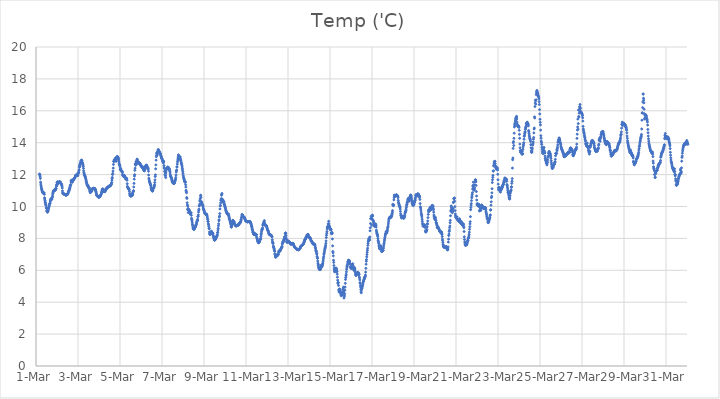
| Category | Temp ('C) |
|---|---|
| 44986.166666666664 | 12.034 |
| 44986.177083333336 | 12.013 |
| 44986.1875 | 11.928 |
| 44986.197916666664 | 11.856 |
| 44986.208333333336 | 11.757 |
| 44986.21875 | 11.527 |
| 44986.229166666664 | 11.407 |
| 44986.239583333336 | 11.298 |
| 44986.25 | 11.218 |
| 44986.260416666664 | 11.14 |
| 44986.270833333336 | 11.085 |
| 44986.28125 | 11.029 |
| 44986.291666666664 | 10.981 |
| 44986.302083333336 | 10.935 |
| 44986.3125 | 10.884 |
| 44986.322916666664 | 10.879 |
| 44986.333333333336 | 10.862 |
| 44986.34375 | 10.838 |
| 44986.354166666664 | 10.84 |
| 44986.364583333336 | 10.852 |
| 44986.375 | 10.844 |
| 44986.385416666664 | 10.856 |
| 44986.395833333336 | 10.761 |
| 44986.40625 | 10.544 |
| 44986.416666666664 | 10.469 |
| 44986.427083333336 | 10.374 |
| 44986.4375 | 10.273 |
| 44986.447916666664 | 10.234 |
| 44986.458333333336 | 10.157 |
| 44986.46875 | 10.096 |
| 44986.479166666664 | 10.082 |
| 44986.489583333336 | 9.933 |
| 44986.5 | 9.889 |
| 44986.510416666664 | 9.725 |
| 44986.520833333336 | 9.76 |
| 44986.53125 | 9.671 |
| 44986.541666666664 | 9.65 |
| 44986.552083333336 | 9.66 |
| 44986.5625 | 9.676 |
| 44986.572916666664 | 9.746 |
| 44986.583333333336 | 9.793 |
| 44986.59375 | 9.881 |
| 44986.604166666664 | 9.908 |
| 44986.614583333336 | 9.972 |
| 44986.625 | 9.996 |
| 44986.635416666664 | 10.088 |
| 44986.645833333336 | 10.155 |
| 44986.65625 | 10.162 |
| 44986.666666666664 | 10.201 |
| 44986.677083333336 | 10.286 |
| 44986.6875 | 10.369 |
| 44986.697916666664 | 10.435 |
| 44986.708333333336 | 10.478 |
| 44986.71875 | 10.458 |
| 44986.729166666664 | 10.459 |
| 44986.739583333336 | 10.46 |
| 44986.75 | 10.443 |
| 44986.760416666664 | 10.534 |
| 44986.770833333336 | 10.564 |
| 44986.78125 | 10.607 |
| 44986.791666666664 | 10.716 |
| 44986.802083333336 | 10.809 |
| 44986.8125 | 10.876 |
| 44986.822916666664 | 10.927 |
| 44986.833333333336 | 10.964 |
| 44986.84375 | 10.987 |
| 44986.854166666664 | 11.011 |
| 44986.864583333336 | 11.025 |
| 44986.875 | 11.035 |
| 44986.885416666664 | 11.037 |
| 44986.895833333336 | 11.038 |
| 44986.90625 | 11.039 |
| 44986.916666666664 | 11.016 |
| 44986.927083333336 | 11.037 |
| 44986.9375 | 11.1 |
| 44986.947916666664 | 11.151 |
| 44986.958333333336 | 11.122 |
| 44986.96875 | 11.281 |
| 44986.979166666664 | 11.364 |
| 44986.989583333336 | 11.3 |
| 44987.0 | 11.504 |
| 44987.010416666664 | 11.483 |
| 44987.020833333336 | 11.418 |
| 44987.03125 | 11.565 |
| 44987.041666666664 | 11.452 |
| 44987.052083333336 | 11.453 |
| 44987.0625 | 11.455 |
| 44987.072916666664 | 11.481 |
| 44987.083333333336 | 11.502 |
| 44987.09375 | 11.519 |
| 44987.104166666664 | 11.537 |
| 44987.114583333336 | 11.541 |
| 44987.125 | 11.547 |
| 44987.135416666664 | 11.523 |
| 44987.145833333336 | 11.537 |
| 44987.15625 | 11.538 |
| 44987.166666666664 | 11.507 |
| 44987.177083333336 | 11.448 |
| 44987.1875 | 11.435 |
| 44987.197916666664 | 11.417 |
| 44987.208333333336 | 11.402 |
| 44987.21875 | 11.386 |
| 44987.229166666664 | 11.338 |
| 44987.239583333336 | 11.27 |
| 44987.25 | 11.157 |
| 44987.260416666664 | 10.979 |
| 44987.270833333336 | 10.867 |
| 44987.28125 | 10.803 |
| 44987.291666666664 | 10.82 |
| 44987.302083333336 | 10.815 |
| 44987.3125 | 10.8 |
| 44987.322916666664 | 10.79 |
| 44987.333333333336 | 10.78 |
| 44987.34375 | 10.767 |
| 44987.354166666664 | 10.758 |
| 44987.364583333336 | 10.757 |
| 44987.375 | 10.745 |
| 44987.385416666664 | 10.734 |
| 44987.395833333336 | 10.734 |
| 44987.40625 | 10.727 |
| 44987.416666666664 | 10.717 |
| 44987.427083333336 | 10.716 |
| 44987.4375 | 10.756 |
| 44987.447916666664 | 10.721 |
| 44987.458333333336 | 10.734 |
| 44987.46875 | 10.74 |
| 44987.479166666664 | 10.741 |
| 44987.489583333336 | 10.746 |
| 44987.5 | 10.768 |
| 44987.510416666664 | 10.786 |
| 44987.520833333336 | 10.828 |
| 44987.53125 | 10.853 |
| 44987.541666666664 | 10.918 |
| 44987.552083333336 | 10.949 |
| 44987.5625 | 10.969 |
| 44987.572916666664 | 10.996 |
| 44987.583333333336 | 11.05 |
| 44987.59375 | 11.083 |
| 44987.604166666664 | 11.145 |
| 44987.614583333336 | 11.179 |
| 44987.625 | 11.248 |
| 44987.635416666664 | 11.318 |
| 44987.645833333336 | 11.363 |
| 44987.65625 | 11.368 |
| 44987.666666666664 | 11.534 |
| 44987.677083333336 | 11.626 |
| 44987.6875 | 11.626 |
| 44987.697916666664 | 11.645 |
| 44987.708333333336 | 11.579 |
| 44987.71875 | 11.544 |
| 44987.729166666664 | 11.524 |
| 44987.739583333336 | 11.598 |
| 44987.75 | 11.623 |
| 44987.760416666664 | 11.624 |
| 44987.770833333336 | 11.628 |
| 44987.78125 | 11.681 |
| 44987.791666666664 | 11.699 |
| 44987.802083333336 | 11.722 |
| 44987.8125 | 11.749 |
| 44987.822916666664 | 11.748 |
| 44987.833333333336 | 11.764 |
| 44987.84375 | 11.775 |
| 44987.854166666664 | 11.807 |
| 44987.864583333336 | 11.849 |
| 44987.875 | 11.904 |
| 44987.885416666664 | 11.949 |
| 44987.895833333336 | 11.959 |
| 44987.90625 | 11.962 |
| 44987.916666666664 | 11.957 |
| 44987.927083333336 | 11.962 |
| 44987.9375 | 11.98 |
| 44987.947916666664 | 11.977 |
| 44987.958333333336 | 11.976 |
| 44987.96875 | 11.975 |
| 44987.979166666664 | 11.944 |
| 44987.989583333336 | 11.935 |
| 44988.0 | 12.038 |
| 44988.010416666664 | 12.122 |
| 44988.020833333336 | 12.107 |
| 44988.03125 | 12.126 |
| 44988.041666666664 | 12.238 |
| 44988.052083333336 | 12.302 |
| 44988.0625 | 12.454 |
| 44988.072916666664 | 12.564 |
| 44988.083333333336 | 12.496 |
| 44988.09375 | 12.642 |
| 44988.104166666664 | 12.684 |
| 44988.114583333336 | 12.73 |
| 44988.125 | 12.717 |
| 44988.135416666664 | 12.828 |
| 44988.145833333336 | 12.867 |
| 44988.15625 | 12.881 |
| 44988.166666666664 | 12.892 |
| 44988.177083333336 | 12.907 |
| 44988.1875 | 12.868 |
| 44988.197916666664 | 12.775 |
| 44988.208333333336 | 12.751 |
| 44988.21875 | 12.7 |
| 44988.229166666664 | 12.627 |
| 44988.239583333336 | 12.588 |
| 44988.25 | 12.504 |
| 44988.260416666664 | 12.387 |
| 44988.270833333336 | 12.233 |
| 44988.28125 | 12.117 |
| 44988.291666666664 | 12.044 |
| 44988.302083333336 | 12.011 |
| 44988.3125 | 11.971 |
| 44988.322916666664 | 11.938 |
| 44988.333333333336 | 11.898 |
| 44988.34375 | 11.865 |
| 44988.354166666664 | 11.817 |
| 44988.364583333336 | 11.778 |
| 44988.375 | 11.703 |
| 44988.385416666664 | 11.651 |
| 44988.395833333336 | 11.576 |
| 44988.40625 | 11.512 |
| 44988.416666666664 | 11.445 |
| 44988.427083333336 | 11.386 |
| 44988.4375 | 11.345 |
| 44988.447916666664 | 11.343 |
| 44988.458333333336 | 11.293 |
| 44988.46875 | 11.29 |
| 44988.479166666664 | 11.292 |
| 44988.489583333336 | 11.243 |
| 44988.5 | 11.19 |
| 44988.510416666664 | 11.175 |
| 44988.520833333336 | 11.184 |
| 44988.53125 | 11.178 |
| 44988.541666666664 | 11.132 |
| 44988.552083333336 | 11.045 |
| 44988.5625 | 10.975 |
| 44988.572916666664 | 10.932 |
| 44988.583333333336 | 10.862 |
| 44988.59375 | 10.915 |
| 44988.604166666664 | 10.91 |
| 44988.614583333336 | 10.967 |
| 44988.625 | 10.944 |
| 44988.635416666664 | 10.998 |
| 44988.645833333336 | 10.94 |
| 44988.65625 | 10.991 |
| 44988.666666666664 | 11.103 |
| 44988.677083333336 | 11.09 |
| 44988.6875 | 11.102 |
| 44988.697916666664 | 11.098 |
| 44988.708333333336 | 11.112 |
| 44988.71875 | 11.13 |
| 44988.729166666664 | 11.146 |
| 44988.739583333336 | 11.131 |
| 44988.75 | 11.124 |
| 44988.760416666664 | 11.103 |
| 44988.770833333336 | 11.111 |
| 44988.78125 | 11.124 |
| 44988.791666666664 | 11.134 |
| 44988.802083333336 | 11.118 |
| 44988.8125 | 11.092 |
| 44988.822916666664 | 11.064 |
| 44988.833333333336 | 11.033 |
| 44988.84375 | 10.979 |
| 44988.854166666664 | 10.935 |
| 44988.864583333336 | 10.882 |
| 44988.875 | 10.801 |
| 44988.885416666664 | 10.725 |
| 44988.895833333336 | 10.688 |
| 44988.90625 | 10.678 |
| 44988.916666666664 | 10.673 |
| 44988.927083333336 | 10.656 |
| 44988.9375 | 10.645 |
| 44988.947916666664 | 10.626 |
| 44988.958333333336 | 10.607 |
| 44988.96875 | 10.598 |
| 44988.979166666664 | 10.585 |
| 44988.989583333336 | 10.58 |
| 44989.0 | 10.601 |
| 44989.010416666664 | 10.665 |
| 44989.020833333336 | 10.613 |
| 44989.03125 | 10.597 |
| 44989.041666666664 | 10.617 |
| 44989.052083333336 | 10.633 |
| 44989.0625 | 10.67 |
| 44989.072916666664 | 10.692 |
| 44989.083333333336 | 10.722 |
| 44989.09375 | 10.741 |
| 44989.104166666664 | 10.78 |
| 44989.114583333336 | 10.831 |
| 44989.125 | 10.898 |
| 44989.135416666664 | 10.932 |
| 44989.145833333336 | 11.014 |
| 44989.15625 | 11.047 |
| 44989.166666666664 | 11.088 |
| 44989.177083333336 | 11.102 |
| 44989.1875 | 11.091 |
| 44989.197916666664 | 11.042 |
| 44989.208333333336 | 11.009 |
| 44989.21875 | 11.033 |
| 44989.229166666664 | 10.931 |
| 44989.239583333336 | 10.92 |
| 44989.25 | 10.937 |
| 44989.260416666664 | 10.959 |
| 44989.270833333336 | 10.952 |
| 44989.28125 | 10.957 |
| 44989.291666666664 | 10.938 |
| 44989.302083333336 | 11.001 |
| 44989.3125 | 11.059 |
| 44989.322916666664 | 11.086 |
| 44989.333333333336 | 11.079 |
| 44989.34375 | 11.1 |
| 44989.354166666664 | 11.113 |
| 44989.364583333336 | 11.128 |
| 44989.375 | 11.157 |
| 44989.385416666664 | 11.175 |
| 44989.395833333336 | 11.187 |
| 44989.40625 | 11.197 |
| 44989.416666666664 | 11.201 |
| 44989.427083333336 | 11.21 |
| 44989.4375 | 11.225 |
| 44989.447916666664 | 11.242 |
| 44989.458333333336 | 11.236 |
| 44989.46875 | 11.275 |
| 44989.479166666664 | 11.275 |
| 44989.489583333336 | 11.276 |
| 44989.5 | 11.269 |
| 44989.510416666664 | 11.295 |
| 44989.520833333336 | 11.287 |
| 44989.53125 | 11.295 |
| 44989.541666666664 | 11.306 |
| 44989.552083333336 | 11.324 |
| 44989.5625 | 11.341 |
| 44989.572916666664 | 11.382 |
| 44989.583333333336 | 11.382 |
| 44989.59375 | 11.458 |
| 44989.604166666664 | 11.506 |
| 44989.614583333336 | 11.649 |
| 44989.625 | 11.755 |
| 44989.635416666664 | 11.825 |
| 44989.645833333336 | 12.004 |
| 44989.65625 | 12.066 |
| 44989.666666666664 | 12.218 |
| 44989.677083333336 | 12.409 |
| 44989.6875 | 12.638 |
| 44989.697916666664 | 12.835 |
| 44989.708333333336 | 12.826 |
| 44989.71875 | 12.834 |
| 44989.729166666664 | 12.931 |
| 44989.739583333336 | 12.883 |
| 44989.75 | 12.9 |
| 44989.760416666664 | 12.963 |
| 44989.770833333336 | 12.946 |
| 44989.78125 | 13.034 |
| 44989.791666666664 | 13.007 |
| 44989.802083333336 | 12.926 |
| 44989.8125 | 12.829 |
| 44989.822916666664 | 12.911 |
| 44989.833333333336 | 12.992 |
| 44989.84375 | 13.068 |
| 44989.854166666664 | 13.107 |
| 44989.864583333336 | 13.126 |
| 44989.875 | 13.131 |
| 44989.885416666664 | 13.118 |
| 44989.895833333336 | 13.101 |
| 44989.90625 | 13.075 |
| 44989.916666666664 | 13.032 |
| 44989.927083333336 | 12.999 |
| 44989.9375 | 12.925 |
| 44989.947916666664 | 12.819 |
| 44989.958333333336 | 12.714 |
| 44989.96875 | 12.647 |
| 44989.979166666664 | 12.61 |
| 44989.989583333336 | 12.562 |
| 44990.0 | 12.481 |
| 44990.010416666664 | 12.341 |
| 44990.020833333336 | 12.314 |
| 44990.03125 | 12.384 |
| 44990.041666666664 | 12.295 |
| 44990.052083333336 | 12.269 |
| 44990.0625 | 12.237 |
| 44990.072916666664 | 12.246 |
| 44990.083333333336 | 12.206 |
| 44990.09375 | 12.211 |
| 44990.104166666664 | 12.189 |
| 44990.114583333336 | 12.121 |
| 44990.125 | 12.004 |
| 44990.135416666664 | 11.938 |
| 44990.145833333336 | 11.954 |
| 44990.15625 | 11.921 |
| 44990.166666666664 | 11.882 |
| 44990.177083333336 | 11.91 |
| 44990.1875 | 11.89 |
| 44990.197916666664 | 11.958 |
| 44990.208333333336 | 11.926 |
| 44990.21875 | 11.89 |
| 44990.229166666664 | 11.879 |
| 44990.239583333336 | 11.82 |
| 44990.25 | 11.808 |
| 44990.260416666664 | 11.76 |
| 44990.270833333336 | 11.732 |
| 44990.28125 | 11.739 |
| 44990.291666666664 | 11.762 |
| 44990.302083333336 | 11.759 |
| 44990.3125 | 11.77 |
| 44990.322916666664 | 11.72 |
| 44990.333333333336 | 11.645 |
| 44990.34375 | 11.427 |
| 44990.354166666664 | 11.259 |
| 44990.364583333336 | 11.217 |
| 44990.375 | 11.196 |
| 44990.385416666664 | 11.162 |
| 44990.395833333336 | 11.135 |
| 44990.40625 | 11.117 |
| 44990.416666666664 | 11.1 |
| 44990.427083333336 | 11.086 |
| 44990.4375 | 11.056 |
| 44990.447916666664 | 10.952 |
| 44990.458333333336 | 10.825 |
| 44990.46875 | 10.729 |
| 44990.479166666664 | 10.695 |
| 44990.489583333336 | 10.688 |
| 44990.5 | 10.666 |
| 44990.510416666664 | 10.657 |
| 44990.520833333336 | 10.653 |
| 44990.53125 | 10.657 |
| 44990.541666666664 | 10.736 |
| 44990.552083333336 | 10.792 |
| 44990.5625 | 10.687 |
| 44990.572916666664 | 10.685 |
| 44990.583333333336 | 10.72 |
| 44990.59375 | 10.737 |
| 44990.604166666664 | 10.74 |
| 44990.614583333336 | 10.86 |
| 44990.625 | 10.927 |
| 44990.635416666664 | 10.983 |
| 44990.645833333336 | 10.982 |
| 44990.65625 | 11.224 |
| 44990.666666666664 | 11.449 |
| 44990.677083333336 | 11.715 |
| 44990.6875 | 11.909 |
| 44990.697916666664 | 11.996 |
| 44990.708333333336 | 12.269 |
| 44990.71875 | 12.404 |
| 44990.729166666664 | 12.675 |
| 44990.739583333336 | 12.631 |
| 44990.75 | 12.584 |
| 44990.760416666664 | 12.796 |
| 44990.770833333336 | 12.726 |
| 44990.78125 | 12.807 |
| 44990.791666666664 | 12.823 |
| 44990.802083333336 | 12.892 |
| 44990.8125 | 12.967 |
| 44990.822916666664 | 12.955 |
| 44990.833333333336 | 12.86 |
| 44990.84375 | 12.727 |
| 44990.854166666664 | 12.714 |
| 44990.864583333336 | 12.696 |
| 44990.875 | 12.716 |
| 44990.885416666664 | 12.781 |
| 44990.895833333336 | 12.773 |
| 44990.90625 | 12.76 |
| 44990.916666666664 | 12.746 |
| 44990.927083333336 | 12.725 |
| 44990.9375 | 12.711 |
| 44990.947916666664 | 12.685 |
| 44990.958333333336 | 12.666 |
| 44990.96875 | 12.644 |
| 44990.979166666664 | 12.602 |
| 44990.989583333336 | 12.584 |
| 44991.0 | 12.56 |
| 44991.010416666664 | 12.528 |
| 44991.020833333336 | 12.509 |
| 44991.03125 | 12.493 |
| 44991.041666666664 | 12.472 |
| 44991.052083333336 | 12.492 |
| 44991.0625 | 12.516 |
| 44991.072916666664 | 12.445 |
| 44991.083333333336 | 12.412 |
| 44991.09375 | 12.399 |
| 44991.104166666664 | 12.375 |
| 44991.114583333336 | 12.347 |
| 44991.125 | 12.322 |
| 44991.135416666664 | 12.262 |
| 44991.145833333336 | 12.241 |
| 44991.15625 | 12.234 |
| 44991.166666666664 | 12.257 |
| 44991.177083333336 | 12.3 |
| 44991.1875 | 12.327 |
| 44991.197916666664 | 12.427 |
| 44991.208333333336 | 12.502 |
| 44991.21875 | 12.521 |
| 44991.229166666664 | 12.538 |
| 44991.239583333336 | 12.59 |
| 44991.25 | 12.585 |
| 44991.260416666664 | 12.586 |
| 44991.270833333336 | 12.562 |
| 44991.28125 | 12.528 |
| 44991.291666666664 | 12.511 |
| 44991.302083333336 | 12.441 |
| 44991.3125 | 12.425 |
| 44991.322916666664 | 12.427 |
| 44991.333333333336 | 12.394 |
| 44991.34375 | 12.34 |
| 44991.354166666664 | 12.211 |
| 44991.364583333336 | 11.974 |
| 44991.375 | 11.772 |
| 44991.385416666664 | 11.67 |
| 44991.395833333336 | 11.592 |
| 44991.40625 | 11.559 |
| 44991.416666666664 | 11.51 |
| 44991.427083333336 | 11.472 |
| 44991.4375 | 11.424 |
| 44991.447916666664 | 11.377 |
| 44991.458333333336 | 11.358 |
| 44991.46875 | 11.299 |
| 44991.479166666664 | 11.197 |
| 44991.489583333336 | 11.116 |
| 44991.5 | 11.068 |
| 44991.510416666664 | 11.021 |
| 44991.520833333336 | 11.002 |
| 44991.53125 | 10.98 |
| 44991.541666666664 | 10.972 |
| 44991.552083333336 | 10.972 |
| 44991.5625 | 11.009 |
| 44991.572916666664 | 11.141 |
| 44991.583333333336 | 11.146 |
| 44991.59375 | 11.121 |
| 44991.604166666664 | 11.176 |
| 44991.614583333336 | 11.205 |
| 44991.625 | 11.271 |
| 44991.635416666664 | 11.291 |
| 44991.645833333336 | 11.37 |
| 44991.65625 | 11.506 |
| 44991.666666666664 | 11.669 |
| 44991.677083333336 | 11.874 |
| 44991.6875 | 11.985 |
| 44991.697916666664 | 12.36 |
| 44991.708333333336 | 12.608 |
| 44991.71875 | 12.907 |
| 44991.729166666664 | 13.127 |
| 44991.739583333336 | 13.344 |
| 44991.75 | 13.199 |
| 44991.760416666664 | 13.225 |
| 44991.770833333336 | 13.277 |
| 44991.78125 | 13.363 |
| 44991.791666666664 | 13.42 |
| 44991.802083333336 | 13.465 |
| 44991.8125 | 13.501 |
| 44991.822916666664 | 13.579 |
| 44991.833333333336 | 13.546 |
| 44991.84375 | 13.487 |
| 44991.854166666664 | 13.429 |
| 44991.864583333336 | 13.422 |
| 44991.875 | 13.453 |
| 44991.885416666664 | 13.411 |
| 44991.895833333336 | 13.375 |
| 44991.90625 | 13.318 |
| 44991.916666666664 | 13.306 |
| 44991.927083333336 | 13.281 |
| 44991.9375 | 13.228 |
| 44991.947916666664 | 13.191 |
| 44991.958333333336 | 13.146 |
| 44991.96875 | 13.08 |
| 44991.979166666664 | 13.055 |
| 44991.989583333336 | 13.024 |
| 44992.0 | 12.985 |
| 44992.010416666664 | 12.965 |
| 44992.020833333336 | 12.891 |
| 44992.03125 | 12.854 |
| 44992.041666666664 | 12.809 |
| 44992.052083333336 | 12.782 |
| 44992.0625 | 12.731 |
| 44992.072916666664 | 12.776 |
| 44992.083333333336 | 12.844 |
| 44992.09375 | 12.567 |
| 44992.104166666664 | 12.438 |
| 44992.114583333336 | 12.377 |
| 44992.125 | 12.207 |
| 44992.135416666664 | 12.178 |
| 44992.145833333336 | 12.02 |
| 44992.15625 | 11.943 |
| 44992.166666666664 | 11.938 |
| 44992.177083333336 | 11.816 |
| 44992.1875 | 12.106 |
| 44992.197916666664 | 12.236 |
| 44992.208333333336 | 12.331 |
| 44992.21875 | 12.383 |
| 44992.229166666664 | 12.386 |
| 44992.239583333336 | 12.381 |
| 44992.25 | 12.444 |
| 44992.260416666664 | 12.418 |
| 44992.270833333336 | 12.467 |
| 44992.28125 | 12.469 |
| 44992.291666666664 | 12.45 |
| 44992.302083333336 | 12.447 |
| 44992.3125 | 12.435 |
| 44992.322916666664 | 12.356 |
| 44992.333333333336 | 12.329 |
| 44992.34375 | 12.369 |
| 44992.354166666664 | 12.34 |
| 44992.364583333336 | 12.259 |
| 44992.375 | 12.195 |
| 44992.385416666664 | 12.105 |
| 44992.395833333336 | 11.981 |
| 44992.40625 | 11.919 |
| 44992.416666666664 | 11.892 |
| 44992.427083333336 | 11.849 |
| 44992.4375 | 11.833 |
| 44992.447916666664 | 11.779 |
| 44992.458333333336 | 11.737 |
| 44992.46875 | 11.675 |
| 44992.479166666664 | 11.62 |
| 44992.489583333336 | 11.566 |
| 44992.5 | 11.526 |
| 44992.510416666664 | 11.505 |
| 44992.520833333336 | 11.487 |
| 44992.53125 | 11.47 |
| 44992.541666666664 | 11.465 |
| 44992.552083333336 | 11.466 |
| 44992.5625 | 11.451 |
| 44992.572916666664 | 11.448 |
| 44992.583333333336 | 11.452 |
| 44992.59375 | 11.476 |
| 44992.604166666664 | 11.595 |
| 44992.614583333336 | 11.569 |
| 44992.625 | 11.627 |
| 44992.635416666664 | 11.689 |
| 44992.645833333336 | 11.713 |
| 44992.65625 | 11.821 |
| 44992.666666666664 | 11.974 |
| 44992.677083333336 | 12.162 |
| 44992.6875 | 12.245 |
| 44992.697916666664 | 12.288 |
| 44992.708333333336 | 12.476 |
| 44992.71875 | 12.486 |
| 44992.729166666664 | 12.658 |
| 44992.739583333336 | 12.799 |
| 44992.75 | 12.914 |
| 44992.760416666664 | 13.035 |
| 44992.770833333336 | 13.108 |
| 44992.78125 | 13.242 |
| 44992.791666666664 | 13.168 |
| 44992.802083333336 | 12.979 |
| 44992.8125 | 12.958 |
| 44992.822916666664 | 12.999 |
| 44992.833333333336 | 13.11 |
| 44992.84375 | 13.105 |
| 44992.854166666664 | 13.116 |
| 44992.864583333336 | 13.101 |
| 44992.875 | 12.985 |
| 44992.885416666664 | 12.955 |
| 44992.895833333336 | 12.872 |
| 44992.90625 | 12.798 |
| 44992.916666666664 | 12.725 |
| 44992.927083333336 | 12.697 |
| 44992.9375 | 12.656 |
| 44992.947916666664 | 12.573 |
| 44992.958333333336 | 12.479 |
| 44992.96875 | 12.386 |
| 44992.979166666664 | 12.287 |
| 44992.989583333336 | 12.178 |
| 44993.0 | 12.077 |
| 44993.010416666664 | 11.957 |
| 44993.020833333336 | 11.859 |
| 44993.03125 | 11.801 |
| 44993.041666666664 | 11.747 |
| 44993.052083333336 | 11.7 |
| 44993.0625 | 11.656 |
| 44993.072916666664 | 11.603 |
| 44993.083333333336 | 11.565 |
| 44993.09375 | 11.514 |
| 44993.104166666664 | 11.556 |
| 44993.114583333336 | 11.529 |
| 44993.125 | 11.367 |
| 44993.135416666664 | 11.22 |
| 44993.145833333336 | 11.016 |
| 44993.15625 | 10.941 |
| 44993.166666666664 | 10.862 |
| 44993.177083333336 | 10.562 |
| 44993.1875 | 10.504 |
| 44993.197916666664 | 10.235 |
| 44993.208333333336 | 10.1 |
| 44993.21875 | 9.811 |
| 44993.229166666664 | 10.032 |
| 44993.239583333336 | 9.878 |
| 44993.25 | 9.623 |
| 44993.260416666664 | 9.794 |
| 44993.270833333336 | 9.822 |
| 44993.28125 | 9.799 |
| 44993.291666666664 | 9.748 |
| 44993.302083333336 | 9.753 |
| 44993.3125 | 9.697 |
| 44993.322916666664 | 9.646 |
| 44993.333333333336 | 9.595 |
| 44993.34375 | 9.559 |
| 44993.354166666664 | 9.512 |
| 44993.364583333336 | 9.533 |
| 44993.375 | 9.585 |
| 44993.385416666664 | 9.61 |
| 44993.395833333336 | 9.449 |
| 44993.40625 | 9.266 |
| 44993.416666666664 | 9.173 |
| 44993.427083333336 | 9.107 |
| 44993.4375 | 9.01 |
| 44993.447916666664 | 8.895 |
| 44993.458333333336 | 8.825 |
| 44993.46875 | 8.722 |
| 44993.479166666664 | 8.64 |
| 44993.489583333336 | 8.596 |
| 44993.5 | 8.58 |
| 44993.510416666664 | 8.57 |
| 44993.520833333336 | 8.568 |
| 44993.53125 | 8.587 |
| 44993.541666666664 | 8.618 |
| 44993.552083333336 | 8.646 |
| 44993.5625 | 8.67 |
| 44993.572916666664 | 8.695 |
| 44993.583333333336 | 8.713 |
| 44993.59375 | 8.742 |
| 44993.604166666664 | 8.787 |
| 44993.614583333336 | 8.826 |
| 44993.625 | 8.863 |
| 44993.635416666664 | 8.895 |
| 44993.645833333336 | 8.964 |
| 44993.65625 | 9.024 |
| 44993.666666666664 | 9.065 |
| 44993.677083333336 | 9.103 |
| 44993.6875 | 9.138 |
| 44993.697916666664 | 9.207 |
| 44993.708333333336 | 9.374 |
| 44993.71875 | 9.385 |
| 44993.729166666664 | 9.472 |
| 44993.739583333336 | 9.651 |
| 44993.75 | 9.773 |
| 44993.760416666664 | 9.831 |
| 44993.770833333336 | 10.033 |
| 44993.78125 | 10.052 |
| 44993.791666666664 | 10.146 |
| 44993.802083333336 | 10.335 |
| 44993.8125 | 10.397 |
| 44993.822916666664 | 10.49 |
| 44993.833333333336 | 10.667 |
| 44993.84375 | 10.71 |
| 44993.854166666664 | 10.573 |
| 44993.864583333336 | 10.203 |
| 44993.875 | 10.158 |
| 44993.885416666664 | 10.296 |
| 44993.895833333336 | 10.261 |
| 44993.90625 | 10.167 |
| 44993.916666666664 | 10.135 |
| 44993.927083333336 | 10.113 |
| 44993.9375 | 10.077 |
| 44993.947916666664 | 10.044 |
| 44993.958333333336 | 9.965 |
| 44993.96875 | 9.877 |
| 44993.979166666664 | 9.827 |
| 44993.989583333336 | 9.791 |
| 44994.0 | 9.752 |
| 44994.010416666664 | 9.715 |
| 44994.020833333336 | 9.66 |
| 44994.03125 | 9.615 |
| 44994.041666666664 | 9.572 |
| 44994.052083333336 | 9.556 |
| 44994.0625 | 9.546 |
| 44994.072916666664 | 9.535 |
| 44994.083333333336 | 9.519 |
| 44994.09375 | 9.505 |
| 44994.104166666664 | 9.498 |
| 44994.114583333336 | 9.489 |
| 44994.125 | 9.466 |
| 44994.135416666664 | 9.525 |
| 44994.145833333336 | 9.424 |
| 44994.15625 | 9.351 |
| 44994.166666666664 | 9.261 |
| 44994.177083333336 | 9.177 |
| 44994.1875 | 9.069 |
| 44994.197916666664 | 9.052 |
| 44994.208333333336 | 8.916 |
| 44994.21875 | 8.856 |
| 44994.229166666664 | 8.759 |
| 44994.239583333336 | 8.647 |
| 44994.25 | 8.603 |
| 44994.260416666664 | 8.399 |
| 44994.270833333336 | 8.294 |
| 44994.28125 | 8.267 |
| 44994.291666666664 | 8.247 |
| 44994.302083333336 | 8.268 |
| 44994.3125 | 8.277 |
| 44994.322916666664 | 8.341 |
| 44994.333333333336 | 8.398 |
| 44994.34375 | 8.408 |
| 44994.354166666664 | 8.449 |
| 44994.364583333336 | 8.418 |
| 44994.375 | 8.357 |
| 44994.385416666664 | 8.34 |
| 44994.395833333336 | 8.345 |
| 44994.40625 | 8.347 |
| 44994.416666666664 | 8.332 |
| 44994.427083333336 | 8.297 |
| 44994.4375 | 8.194 |
| 44994.447916666664 | 8.13 |
| 44994.458333333336 | 8.067 |
| 44994.46875 | 8.038 |
| 44994.479166666664 | 7.972 |
| 44994.489583333336 | 7.921 |
| 44994.5 | 7.89 |
| 44994.510416666664 | 7.888 |
| 44994.520833333336 | 7.912 |
| 44994.53125 | 7.934 |
| 44994.541666666664 | 7.957 |
| 44994.552083333336 | 7.975 |
| 44994.5625 | 8.007 |
| 44994.572916666664 | 8.043 |
| 44994.583333333336 | 8.074 |
| 44994.59375 | 8.1 |
| 44994.604166666664 | 8.117 |
| 44994.614583333336 | 8.151 |
| 44994.625 | 8.193 |
| 44994.635416666664 | 8.238 |
| 44994.645833333336 | 8.359 |
| 44994.65625 | 8.386 |
| 44994.666666666664 | 8.524 |
| 44994.677083333336 | 8.632 |
| 44994.6875 | 8.79 |
| 44994.697916666664 | 8.912 |
| 44994.708333333336 | 9.099 |
| 44994.71875 | 9.163 |
| 44994.729166666664 | 9.338 |
| 44994.739583333336 | 9.394 |
| 44994.75 | 9.555 |
| 44994.760416666664 | 9.845 |
| 44994.770833333336 | 10.036 |
| 44994.78125 | 10.067 |
| 44994.791666666664 | 10.226 |
| 44994.802083333336 | 10.401 |
| 44994.8125 | 10.393 |
| 44994.822916666664 | 10.494 |
| 44994.833333333336 | 10.707 |
| 44994.84375 | 10.756 |
| 44994.854166666664 | 10.818 |
| 44994.864583333336 | 10.466 |
| 44994.875 | 10.332 |
| 44994.885416666664 | 10.335 |
| 44994.895833333336 | 10.399 |
| 44994.90625 | 10.402 |
| 44994.916666666664 | 10.312 |
| 44994.927083333336 | 10.263 |
| 44994.9375 | 10.245 |
| 44994.947916666664 | 10.306 |
| 44994.958333333336 | 10.188 |
| 44994.96875 | 10.13 |
| 44994.979166666664 | 10.094 |
| 44994.989583333336 | 10.042 |
| 44995.0 | 9.989 |
| 44995.010416666664 | 9.936 |
| 44995.020833333336 | 9.888 |
| 44995.03125 | 9.818 |
| 44995.041666666664 | 9.754 |
| 44995.052083333336 | 9.719 |
| 44995.0625 | 9.681 |
| 44995.072916666664 | 9.641 |
| 44995.083333333336 | 9.598 |
| 44995.09375 | 9.578 |
| 44995.104166666664 | 9.545 |
| 44995.114583333336 | 9.53 |
| 44995.125 | 9.511 |
| 44995.135416666664 | 9.501 |
| 44995.145833333336 | 9.494 |
| 44995.15625 | 9.52 |
| 44995.166666666664 | 9.529 |
| 44995.177083333336 | 9.428 |
| 44995.1875 | 9.357 |
| 44995.197916666664 | 9.323 |
| 44995.208333333336 | 9.236 |
| 44995.21875 | 9.193 |
| 44995.229166666664 | 9.147 |
| 44995.239583333336 | 9.088 |
| 44995.25 | 9.04 |
| 44995.260416666664 | 8.99 |
| 44995.270833333336 | 8.926 |
| 44995.28125 | 8.855 |
| 44995.291666666664 | 8.747 |
| 44995.302083333336 | 8.7 |
| 44995.3125 | 8.74 |
| 44995.322916666664 | 8.821 |
| 44995.333333333336 | 8.876 |
| 44995.34375 | 8.914 |
| 44995.354166666664 | 9.022 |
| 44995.364583333336 | 9.099 |
| 44995.375 | 9.138 |
| 44995.385416666664 | 9.105 |
| 44995.395833333336 | 9.106 |
| 44995.40625 | 9.032 |
| 44995.416666666664 | 9.006 |
| 44995.427083333336 | 9.05 |
| 44995.4375 | 9.023 |
| 44995.447916666664 | 8.947 |
| 44995.458333333336 | 8.914 |
| 44995.46875 | 8.877 |
| 44995.479166666664 | 8.843 |
| 44995.489583333336 | 8.821 |
| 44995.5 | 8.802 |
| 44995.510416666664 | 8.796 |
| 44995.520833333336 | 8.786 |
| 44995.53125 | 8.783 |
| 44995.541666666664 | 8.784 |
| 44995.552083333336 | 8.79 |
| 44995.5625 | 8.803 |
| 44995.572916666664 | 8.812 |
| 44995.583333333336 | 8.831 |
| 44995.59375 | 8.828 |
| 44995.604166666664 | 8.828 |
| 44995.614583333336 | 8.831 |
| 44995.625 | 8.838 |
| 44995.635416666664 | 8.845 |
| 44995.645833333336 | 8.853 |
| 44995.65625 | 8.86 |
| 44995.666666666664 | 8.906 |
| 44995.677083333336 | 8.929 |
| 44995.6875 | 8.947 |
| 44995.697916666664 | 8.938 |
| 44995.708333333336 | 8.978 |
| 44995.71875 | 8.992 |
| 44995.729166666664 | 8.99 |
| 44995.739583333336 | 9.032 |
| 44995.75 | 9.04 |
| 44995.760416666664 | 9.134 |
| 44995.770833333336 | 9.186 |
| 44995.78125 | 9.289 |
| 44995.791666666664 | 9.325 |
| 44995.802083333336 | 9.41 |
| 44995.8125 | 9.501 |
| 44995.822916666664 | 9.484 |
| 44995.833333333336 | 9.425 |
| 44995.84375 | 9.437 |
| 44995.854166666664 | 9.381 |
| 44995.864583333336 | 9.34 |
| 44995.875 | 9.33 |
| 44995.885416666664 | 9.324 |
| 44995.895833333336 | 9.319 |
| 44995.90625 | 9.328 |
| 44995.916666666664 | 9.323 |
| 44995.927083333336 | 9.304 |
| 44995.9375 | 9.284 |
| 44995.947916666664 | 9.241 |
| 44995.958333333336 | 9.186 |
| 44995.96875 | 9.152 |
| 44995.979166666664 | 9.122 |
| 44995.989583333336 | 9.103 |
| 44996.0 | 9.092 |
| 44996.010416666664 | 9.073 |
| 44996.020833333336 | 9.063 |
| 44996.03125 | 9.064 |
| 44996.041666666664 | 9.053 |
| 44996.052083333336 | 9.039 |
| 44996.0625 | 9.04 |
| 44996.072916666664 | 9.042 |
| 44996.083333333336 | 9.047 |
| 44996.09375 | 9.053 |
| 44996.104166666664 | 9.057 |
| 44996.114583333336 | 9.057 |
| 44996.125 | 9.058 |
| 44996.135416666664 | 9.056 |
| 44996.145833333336 | 9.055 |
| 44996.15625 | 9.056 |
| 44996.166666666664 | 9.056 |
| 44996.177083333336 | 9.047 |
| 44996.1875 | 9.047 |
| 44996.197916666664 | 9.048 |
| 44996.208333333336 | 9.008 |
| 44996.21875 | 8.975 |
| 44996.229166666664 | 8.94 |
| 44996.239583333336 | 8.907 |
| 44996.25 | 8.86 |
| 44996.260416666664 | 8.794 |
| 44996.270833333336 | 8.75 |
| 44996.28125 | 8.699 |
| 44996.291666666664 | 8.629 |
| 44996.302083333336 | 8.559 |
| 44996.3125 | 8.496 |
| 44996.322916666664 | 8.405 |
| 44996.333333333336 | 8.38 |
| 44996.34375 | 8.339 |
| 44996.354166666664 | 8.281 |
| 44996.364583333336 | 8.255 |
| 44996.375 | 8.25 |
| 44996.385416666664 | 8.323 |
| 44996.395833333336 | 8.342 |
| 44996.40625 | 8.285 |
| 44996.416666666664 | 8.294 |
| 44996.427083333336 | 8.269 |
| 44996.4375 | 8.264 |
| 44996.447916666664 | 8.239 |
| 44996.458333333336 | 8.199 |
| 44996.46875 | 8.253 |
| 44996.479166666664 | 8.246 |
| 44996.489583333336 | 8.246 |
| 44996.5 | 8.226 |
| 44996.510416666664 | 8.074 |
| 44996.520833333336 | 8.012 |
| 44996.53125 | 7.963 |
| 44996.541666666664 | 7.897 |
| 44996.552083333336 | 7.855 |
| 44996.5625 | 7.826 |
| 44996.572916666664 | 7.778 |
| 44996.583333333336 | 7.75 |
| 44996.59375 | 7.736 |
| 44996.604166666664 | 7.732 |
| 44996.614583333336 | 7.735 |
| 44996.625 | 7.746 |
| 44996.635416666664 | 7.781 |
| 44996.645833333336 | 7.834 |
| 44996.65625 | 7.872 |
| 44996.666666666664 | 7.919 |
| 44996.677083333336 | 7.972 |
| 44996.6875 | 7.961 |
| 44996.697916666664 | 7.981 |
| 44996.708333333336 | 8.113 |
| 44996.71875 | 8.228 |
| 44996.729166666664 | 8.308 |
| 44996.739583333336 | 8.414 |
| 44996.75 | 8.511 |
| 44996.760416666664 | 8.541 |
| 44996.770833333336 | 8.61 |
| 44996.78125 | 8.578 |
| 44996.791666666664 | 8.661 |
| 44996.802083333336 | 8.821 |
| 44996.8125 | 8.862 |
| 44996.822916666664 | 8.911 |
| 44996.833333333336 | 8.879 |
| 44996.84375 | 9.014 |
| 44996.854166666664 | 8.957 |
| 44996.864583333336 | 9.043 |
| 44996.875 | 9.117 |
| 44996.885416666664 | 8.955 |
| 44996.895833333336 | 8.862 |
| 44996.90625 | 8.845 |
| 44996.916666666664 | 8.814 |
| 44996.927083333336 | 8.835 |
| 44996.9375 | 8.844 |
| 44996.947916666664 | 8.832 |
| 44996.958333333336 | 8.802 |
| 44996.96875 | 8.78 |
| 44996.979166666664 | 8.771 |
| 44996.989583333336 | 8.719 |
| 44997.0 | 8.675 |
| 44997.010416666664 | 8.612 |
| 44997.020833333336 | 8.559 |
| 44997.03125 | 8.528 |
| 44997.041666666664 | 8.493 |
| 44997.052083333336 | 8.474 |
| 44997.0625 | 8.441 |
| 44997.072916666664 | 8.391 |
| 44997.083333333336 | 8.337 |
| 44997.09375 | 8.295 |
| 44997.104166666664 | 8.258 |
| 44997.114583333336 | 8.255 |
| 44997.125 | 8.238 |
| 44997.135416666664 | 8.231 |
| 44997.145833333336 | 8.226 |
| 44997.15625 | 8.215 |
| 44997.166666666664 | 8.211 |
| 44997.177083333336 | 8.211 |
| 44997.1875 | 8.2 |
| 44997.197916666664 | 8.201 |
| 44997.208333333336 | 8.176 |
| 44997.21875 | 8.157 |
| 44997.229166666664 | 8.128 |
| 44997.239583333336 | 8.095 |
| 44997.25 | 7.917 |
| 44997.260416666664 | 7.807 |
| 44997.270833333336 | 7.727 |
| 44997.28125 | 7.713 |
| 44997.291666666664 | 7.681 |
| 44997.302083333336 | 7.518 |
| 44997.3125 | 7.441 |
| 44997.322916666664 | 7.459 |
| 44997.333333333336 | 7.376 |
| 44997.34375 | 7.32 |
| 44997.354166666664 | 7.227 |
| 44997.364583333336 | 7.196 |
| 44997.375 | 7.038 |
| 44997.385416666664 | 6.99 |
| 44997.395833333336 | 6.902 |
| 44997.40625 | 6.811 |
| 44997.416666666664 | 6.851 |
| 44997.427083333336 | 6.847 |
| 44997.4375 | 6.898 |
| 44997.447916666664 | 6.922 |
| 44997.458333333336 | 6.96 |
| 44997.46875 | 6.914 |
| 44997.479166666664 | 6.899 |
| 44997.489583333336 | 6.936 |
| 44997.5 | 6.93 |
| 44997.510416666664 | 6.954 |
| 44997.520833333336 | 6.972 |
| 44997.53125 | 6.983 |
| 44997.541666666664 | 7.011 |
| 44997.552083333336 | 7.107 |
| 44997.5625 | 7.185 |
| 44997.572916666664 | 7.221 |
| 44997.583333333336 | 7.212 |
| 44997.59375 | 7.188 |
| 44997.604166666664 | 7.185 |
| 44997.614583333336 | 7.207 |
| 44997.625 | 7.233 |
| 44997.635416666664 | 7.263 |
| 44997.645833333336 | 7.296 |
| 44997.65625 | 7.327 |
| 44997.666666666664 | 7.356 |
| 44997.677083333336 | 7.384 |
| 44997.6875 | 7.414 |
| 44997.697916666664 | 7.436 |
| 44997.708333333336 | 7.465 |
| 44997.71875 | 7.5 |
| 44997.729166666664 | 7.66 |
| 44997.739583333336 | 7.671 |
| 44997.75 | 7.75 |
| 44997.760416666664 | 7.811 |
| 44997.770833333336 | 7.796 |
| 44997.78125 | 7.786 |
| 44997.791666666664 | 7.886 |
| 44997.802083333336 | 7.897 |
| 44997.8125 | 7.962 |
| 44997.822916666664 | 7.951 |
| 44997.833333333336 | 8.089 |
| 44997.84375 | 8.072 |
| 44997.854166666664 | 8.078 |
| 44997.864583333336 | 8.297 |
| 44997.875 | 8.329 |
| 44997.885416666664 | 8.347 |
| 44997.895833333336 | 8.292 |
| 44997.90625 | 8.173 |
| 44997.916666666664 | 8.01 |
| 44997.927083333336 | 7.91 |
| 44997.9375 | 7.803 |
| 44997.947916666664 | 7.767 |
| 44997.958333333336 | 7.748 |
| 44997.96875 | 7.767 |
| 44997.979166666664 | 7.839 |
| 44997.989583333336 | 7.84 |
| 44998.0 | 7.833 |
| 44998.010416666664 | 7.836 |
| 44998.020833333336 | 7.817 |
| 44998.03125 | 7.806 |
| 44998.041666666664 | 7.794 |
| 44998.052083333336 | 7.772 |
| 44998.0625 | 7.752 |
| 44998.072916666664 | 7.743 |
| 44998.083333333336 | 7.738 |
| 44998.09375 | 7.721 |
| 44998.104166666664 | 7.708 |
| 44998.114583333336 | 7.685 |
| 44998.125 | 7.659 |
| 44998.135416666664 | 7.648 |
| 44998.145833333336 | 7.64 |
| 44998.15625 | 7.636 |
| 44998.166666666664 | 7.646 |
| 44998.177083333336 | 7.667 |
| 44998.1875 | 7.666 |
| 44998.197916666664 | 7.691 |
| 44998.208333333336 | 7.674 |
| 44998.21875 | 7.683 |
| 44998.229166666664 | 7.691 |
| 44998.239583333336 | 7.69 |
| 44998.25 | 7.636 |
| 44998.260416666664 | 7.651 |
| 44998.270833333336 | 7.579 |
| 44998.28125 | 7.566 |
| 44998.291666666664 | 7.515 |
| 44998.302083333336 | 7.486 |
| 44998.3125 | 7.459 |
| 44998.322916666664 | 7.447 |
| 44998.333333333336 | 7.428 |
| 44998.34375 | 7.407 |
| 44998.354166666664 | 7.398 |
| 44998.364583333336 | 7.39 |
| 44998.375 | 7.391 |
| 44998.385416666664 | 7.372 |
| 44998.395833333336 | 7.345 |
| 44998.40625 | 7.338 |
| 44998.416666666664 | 7.331 |
| 44998.427083333336 | 7.31 |
| 44998.4375 | 7.317 |
| 44998.447916666664 | 7.31 |
| 44998.458333333336 | 7.308 |
| 44998.46875 | 7.29 |
| 44998.479166666664 | 7.288 |
| 44998.489583333336 | 7.289 |
| 44998.5 | 7.294 |
| 44998.510416666664 | 7.296 |
| 44998.520833333336 | 7.289 |
| 44998.53125 | 7.32 |
| 44998.541666666664 | 7.321 |
| 44998.552083333336 | 7.338 |
| 44998.5625 | 7.364 |
| 44998.572916666664 | 7.371 |
| 44998.583333333336 | 7.41 |
| 44998.59375 | 7.453 |
| 44998.604166666664 | 7.491 |
| 44998.614583333336 | 7.517 |
| 44998.625 | 7.517 |
| 44998.635416666664 | 7.523 |
| 44998.645833333336 | 7.535 |
| 44998.65625 | 7.551 |
| 44998.666666666664 | 7.567 |
| 44998.677083333336 | 7.58 |
| 44998.6875 | 7.593 |
| 44998.697916666664 | 7.607 |
| 44998.708333333336 | 7.622 |
| 44998.71875 | 7.635 |
| 44998.729166666664 | 7.652 |
| 44998.739583333336 | 7.668 |
| 44998.75 | 7.714 |
| 44998.760416666664 | 7.737 |
| 44998.770833333336 | 7.806 |
| 44998.78125 | 7.8 |
| 44998.791666666664 | 7.879 |
| 44998.802083333336 | 7.934 |
| 44998.8125 | 7.939 |
| 44998.822916666664 | 7.958 |
| 44998.833333333336 | 7.986 |
| 44998.84375 | 7.989 |
| 44998.854166666664 | 8.073 |
| 44998.864583333336 | 8.073 |
| 44998.875 | 8.11 |
| 44998.885416666664 | 8.129 |
| 44998.895833333336 | 8.141 |
| 44998.90625 | 8.22 |
| 44998.916666666664 | 8.135 |
| 44998.927083333336 | 8.212 |
| 44998.9375 | 8.208 |
| 44998.947916666664 | 8.249 |
| 44998.958333333336 | 8.254 |
| 44998.96875 | 8.187 |
| 44998.979166666664 | 8.141 |
| 44998.989583333336 | 8.104 |
| 44999.0 | 8.061 |
| 44999.010416666664 | 8.04 |
| 44999.020833333336 | 8.054 |
| 44999.03125 | 8.054 |
| 44999.041666666664 | 8.045 |
| 44999.052083333336 | 8.03 |
| 44999.0625 | 8.012 |
| 44999.072916666664 | 7.967 |
| 44999.083333333336 | 7.921 |
| 44999.09375 | 7.854 |
| 44999.104166666664 | 7.842 |
| 44999.114583333336 | 7.828 |
| 44999.125 | 7.82 |
| 44999.135416666664 | 7.801 |
| 44999.145833333336 | 7.774 |
| 44999.15625 | 7.747 |
| 44999.166666666664 | 7.717 |
| 44999.177083333336 | 7.686 |
| 44999.1875 | 7.662 |
| 44999.197916666664 | 7.648 |
| 44999.208333333336 | 7.643 |
| 44999.21875 | 7.646 |
| 44999.229166666664 | 7.647 |
| 44999.239583333336 | 7.646 |
| 44999.25 | 7.639 |
| 44999.260416666664 | 7.633 |
| 44999.270833333336 | 7.615 |
| 44999.28125 | 7.581 |
| 44999.291666666664 | 7.524 |
| 44999.302083333336 | 7.428 |
| 44999.3125 | 7.377 |
| 44999.322916666664 | 7.273 |
| 44999.333333333336 | 7.244 |
| 44999.34375 | 7.184 |
| 44999.354166666664 | 7.149 |
| 44999.364583333336 | 7.038 |
| 44999.375 | 7.027 |
| 44999.385416666664 | 6.875 |
| 44999.395833333336 | 6.784 |
| 44999.40625 | 6.746 |
| 44999.416666666664 | 6.579 |
| 44999.427083333336 | 6.443 |
| 44999.4375 | 6.294 |
| 44999.447916666664 | 6.352 |
| 44999.458333333336 | 6.172 |
| 44999.46875 | 6.153 |
| 44999.479166666664 | 6.132 |
| 44999.489583333336 | 6.047 |
| 44999.5 | 6.145 |
| 44999.510416666664 | 6.17 |
| 44999.520833333336 | 6.054 |
| 44999.53125 | 6.055 |
| 44999.541666666664 | 6.049 |
| 44999.552083333336 | 6.092 |
| 44999.5625 | 6.136 |
| 44999.572916666664 | 6.196 |
| 44999.583333333336 | 6.257 |
| 44999.59375 | 6.314 |
| 44999.604166666664 | 6.351 |
| 44999.614583333336 | 6.237 |
| 44999.625 | 6.26 |
| 44999.635416666664 | 6.307 |
| 44999.645833333336 | 6.382 |
| 44999.65625 | 6.438 |
| 44999.666666666664 | 6.532 |
| 44999.677083333336 | 6.645 |
| 44999.6875 | 6.76 |
| 44999.697916666664 | 6.849 |
| 44999.708333333336 | 6.976 |
| 44999.71875 | 7.06 |
| 44999.729166666664 | 7.135 |
| 44999.739583333336 | 7.217 |
| 44999.75 | 7.31 |
| 44999.760416666664 | 7.375 |
| 44999.770833333336 | 7.418 |
| 44999.78125 | 7.48 |
| 44999.791666666664 | 7.573 |
| 44999.802083333336 | 7.69 |
| 44999.8125 | 7.842 |
| 44999.822916666664 | 8.051 |
| 44999.833333333336 | 8.2 |
| 44999.84375 | 8.322 |
| 44999.854166666664 | 8.433 |
| 44999.864583333336 | 8.6 |
| 44999.875 | 8.731 |
| 44999.885416666664 | 8.719 |
| 44999.895833333336 | 8.676 |
| 44999.90625 | 8.715 |
| 44999.916666666664 | 8.918 |
| 44999.927083333336 | 8.837 |
| 44999.9375 | 9.073 |
| 44999.947916666664 | 8.908 |
| 44999.958333333336 | 8.788 |
| 44999.96875 | 8.752 |
| 44999.979166666664 | 8.723 |
| 44999.989583333336 | 8.658 |
| 45000.0 | 8.591 |
| 45000.010416666664 | 8.553 |
| 45000.020833333336 | 8.565 |
| 45000.03125 | 8.601 |
| 45000.041666666664 | 8.546 |
| 45000.052083333336 | 8.542 |
| 45000.0625 | 8.346 |
| 45000.072916666664 | 8.291 |
| 45000.083333333336 | 8.351 |
| 45000.09375 | 8.373 |
| 45000.104166666664 | 8.307 |
| 45000.114583333336 | 7.966 |
| 45000.125 | 7.53 |
| 45000.135416666664 | 7.181 |
| 45000.145833333336 | 7.093 |
| 45000.15625 | 6.906 |
| 45000.166666666664 | 6.629 |
| 45000.177083333336 | 6.494 |
| 45000.1875 | 6.299 |
| 45000.197916666664 | 6.135 |
| 45000.208333333336 | 6.024 |
| 45000.21875 | 5.921 |
| 45000.229166666664 | 5.901 |
| 45000.239583333336 | 5.929 |
| 45000.25 | 5.949 |
| 45000.260416666664 | 5.995 |
| 45000.270833333336 | 6.071 |
| 45000.28125 | 6.138 |
| 45000.291666666664 | 6.128 |
| 45000.302083333336 | 6.111 |
| 45000.3125 | 6.027 |
| 45000.322916666664 | 5.948 |
| 45000.333333333336 | 5.91 |
| 45000.34375 | 5.756 |
| 45000.354166666664 | 5.571 |
| 45000.364583333336 | 5.382 |
| 45000.375 | 5.174 |
| 45000.385416666664 | 5.238 |
| 45000.395833333336 | 5.233 |
| 45000.40625 | 5.048 |
| 45000.416666666664 | 4.776 |
| 45000.427083333336 | 4.643 |
| 45000.4375 | 4.743 |
| 45000.447916666664 | 4.684 |
| 45000.458333333336 | 4.829 |
| 45000.46875 | 4.814 |
| 45000.479166666664 | 4.672 |
| 45000.489583333336 | 4.706 |
| 45000.5 | 4.617 |
| 45000.510416666664 | 4.556 |
| 45000.520833333336 | 4.497 |
| 45000.53125 | 4.421 |
| 45000.541666666664 | 4.411 |
| 45000.552083333336 | 4.435 |
| 45000.5625 | 4.471 |
| 45000.572916666664 | 4.572 |
| 45000.583333333336 | 4.533 |
| 45000.59375 | 4.524 |
| 45000.604166666664 | 4.672 |
| 45000.614583333336 | 4.804 |
| 45000.625 | 4.825 |
| 45000.635416666664 | 4.894 |
| 45000.645833333336 | 4.948 |
| 45000.65625 | 4.656 |
| 45000.666666666664 | 4.258 |
| 45000.677083333336 | 4.354 |
| 45000.6875 | 4.424 |
| 45000.697916666664 | 4.538 |
| 45000.708333333336 | 4.754 |
| 45000.71875 | 4.951 |
| 45000.729166666664 | 5.183 |
| 45000.739583333336 | 5.426 |
| 45000.75 | 5.551 |
| 45000.760416666664 | 5.656 |
| 45000.770833333336 | 5.755 |
| 45000.78125 | 5.902 |
| 45000.791666666664 | 6.056 |
| 45000.802083333336 | 6.15 |
| 45000.8125 | 6.242 |
| 45000.822916666664 | 6.297 |
| 45000.833333333336 | 6.365 |
| 45000.84375 | 6.454 |
| 45000.854166666664 | 6.541 |
| 45000.864583333336 | 6.533 |
| 45000.875 | 6.633 |
| 45000.885416666664 | 6.608 |
| 45000.895833333336 | 6.577 |
| 45000.90625 | 6.595 |
| 45000.916666666664 | 6.62 |
| 45000.927083333336 | 6.561 |
| 45000.9375 | 6.502 |
| 45000.947916666664 | 6.413 |
| 45000.958333333336 | 6.398 |
| 45000.96875 | 6.226 |
| 45000.979166666664 | 6.171 |
| 45000.989583333336 | 6.176 |
| 45001.0 | 6.152 |
| 45001.010416666664 | 6.11 |
| 45001.020833333336 | 6.146 |
| 45001.03125 | 6.162 |
| 45001.041666666664 | 6.272 |
| 45001.052083333336 | 6.309 |
| 45001.0625 | 6.333 |
| 45001.072916666664 | 6.363 |
| 45001.083333333336 | 6.411 |
| 45001.09375 | 6.306 |
| 45001.104166666664 | 6.17 |
| 45001.114583333336 | 6.116 |
| 45001.125 | 6.058 |
| 45001.135416666664 | 6.008 |
| 45001.145833333336 | 6.024 |
| 45001.15625 | 6.098 |
| 45001.166666666664 | 6.174 |
| 45001.177083333336 | 6.117 |
| 45001.1875 | 6.017 |
| 45001.197916666664 | 5.915 |
| 45001.208333333336 | 5.843 |
| 45001.21875 | 5.749 |
| 45001.229166666664 | 5.711 |
| 45001.239583333336 | 5.679 |
| 45001.25 | 5.681 |
| 45001.260416666664 | 5.711 |
| 45001.270833333336 | 5.753 |
| 45001.28125 | 5.797 |
| 45001.291666666664 | 5.833 |
| 45001.302083333336 | 5.852 |
| 45001.3125 | 5.853 |
| 45001.322916666664 | 5.841 |
| 45001.333333333336 | 5.844 |
| 45001.34375 | 5.856 |
| 45001.354166666664 | 5.839 |
| 45001.364583333336 | 5.796 |
| 45001.375 | 5.725 |
| 45001.385416666664 | 5.74 |
| 45001.395833333336 | 5.576 |
| 45001.40625 | 5.522 |
| 45001.416666666664 | 5.399 |
| 45001.427083333336 | 5.219 |
| 45001.4375 | 5.194 |
| 45001.447916666664 | 5.05 |
| 45001.458333333336 | 4.949 |
| 45001.46875 | 4.81 |
| 45001.479166666664 | 4.679 |
| 45001.489583333336 | 4.594 |
| 45001.5 | 4.783 |
| 45001.510416666664 | 4.833 |
| 45001.520833333336 | 4.87 |
| 45001.53125 | 4.95 |
| 45001.541666666664 | 4.992 |
| 45001.552083333336 | 5.067 |
| 45001.5625 | 5.129 |
| 45001.572916666664 | 5.201 |
| 45001.583333333336 | 5.278 |
| 45001.59375 | 5.35 |
| 45001.604166666664 | 5.322 |
| 45001.614583333336 | 5.41 |
| 45001.625 | 5.502 |
| 45001.635416666664 | 5.453 |
| 45001.645833333336 | 5.542 |
| 45001.65625 | 5.566 |
| 45001.666666666664 | 5.593 |
| 45001.677083333336 | 5.629 |
| 45001.6875 | 5.703 |
| 45001.697916666664 | 5.885 |
| 45001.708333333336 | 6.126 |
| 45001.71875 | 6.383 |
| 45001.729166666664 | 6.569 |
| 45001.739583333336 | 6.674 |
| 45001.75 | 6.843 |
| 45001.760416666664 | 6.99 |
| 45001.770833333336 | 7.134 |
| 45001.78125 | 7.262 |
| 45001.791666666664 | 7.386 |
| 45001.802083333336 | 7.561 |
| 45001.8125 | 7.688 |
| 45001.822916666664 | 7.799 |
| 45001.833333333336 | 7.853 |
| 45001.84375 | 7.949 |
| 45001.854166666664 | 7.983 |
| 45001.864583333336 | 7.976 |
| 45001.875 | 7.921 |
| 45001.885416666664 | 7.893 |
| 45001.895833333336 | 8.089 |
| 45001.90625 | 8.477 |
| 45001.916666666664 | 8.67 |
| 45001.927083333336 | 8.93 |
| 45001.9375 | 9.242 |
| 45001.947916666664 | 9.239 |
| 45001.958333333336 | 9.395 |
| 45001.96875 | 9.282 |
| 45001.979166666664 | 9.266 |
| 45001.989583333336 | 8.826 |
| 45002.0 | 9.222 |
| 45002.010416666664 | 9.393 |
| 45002.020833333336 | 9.463 |
| 45002.03125 | 9.403 |
| 45002.041666666664 | 9.144 |
| 45002.052083333336 | 9.144 |
| 45002.0625 | 9.087 |
| 45002.072916666664 | 9.029 |
| 45002.083333333336 | 8.936 |
| 45002.09375 | 8.849 |
| 45002.104166666664 | 8.788 |
| 45002.114583333336 | 8.759 |
| 45002.125 | 8.775 |
| 45002.135416666664 | 8.808 |
| 45002.145833333336 | 8.824 |
| 45002.15625 | 8.87 |
| 45002.166666666664 | 8.909 |
| 45002.177083333336 | 8.881 |
| 45002.1875 | 8.817 |
| 45002.197916666664 | 8.712 |
| 45002.208333333336 | 8.518 |
| 45002.21875 | 8.419 |
| 45002.229166666664 | 8.342 |
| 45002.239583333336 | 8.306 |
| 45002.25 | 8.238 |
| 45002.260416666664 | 8.213 |
| 45002.270833333336 | 8.135 |
| 45002.28125 | 8.003 |
| 45002.291666666664 | 7.883 |
| 45002.302083333336 | 7.814 |
| 45002.3125 | 7.742 |
| 45002.322916666664 | 7.67 |
| 45002.333333333336 | 7.558 |
| 45002.34375 | 7.474 |
| 45002.354166666664 | 7.406 |
| 45002.364583333336 | 7.358 |
| 45002.375 | 7.341 |
| 45002.385416666664 | 7.349 |
| 45002.395833333336 | 7.352 |
| 45002.40625 | 7.407 |
| 45002.416666666664 | 7.545 |
| 45002.427083333336 | 7.441 |
| 45002.4375 | 7.389 |
| 45002.447916666664 | 7.196 |
| 45002.458333333336 | 7.19 |
| 45002.46875 | 7.18 |
| 45002.479166666664 | 7.202 |
| 45002.489583333336 | 7.306 |
| 45002.5 | 7.243 |
| 45002.510416666664 | 7.215 |
| 45002.520833333336 | 7.243 |
| 45002.53125 | 7.257 |
| 45002.541666666664 | 7.371 |
| 45002.552083333336 | 7.478 |
| 45002.5625 | 7.588 |
| 45002.572916666664 | 7.669 |
| 45002.583333333336 | 7.776 |
| 45002.59375 | 7.889 |
| 45002.604166666664 | 7.962 |
| 45002.614583333336 | 8.065 |
| 45002.625 | 8.149 |
| 45002.635416666664 | 8.22 |
| 45002.645833333336 | 8.277 |
| 45002.65625 | 8.304 |
| 45002.666666666664 | 8.35 |
| 45002.677083333336 | 8.421 |
| 45002.6875 | 8.44 |
| 45002.697916666664 | 8.407 |
| 45002.708333333336 | 8.34 |
| 45002.71875 | 8.421 |
| 45002.729166666664 | 8.485 |
| 45002.739583333336 | 8.585 |
| 45002.75 | 8.686 |
| 45002.760416666664 | 8.723 |
| 45002.770833333336 | 8.838 |
| 45002.78125 | 8.963 |
| 45002.791666666664 | 9.082 |
| 45002.802083333336 | 9.179 |
| 45002.8125 | 9.247 |
| 45002.822916666664 | 9.28 |
| 45002.833333333336 | 9.301 |
| 45002.84375 | 9.313 |
| 45002.854166666664 | 9.337 |
| 45002.864583333336 | 9.337 |
| 45002.875 | 9.326 |
| 45002.885416666664 | 9.322 |
| 45002.895833333336 | 9.314 |
| 45002.90625 | 9.336 |
| 45002.916666666664 | 9.355 |
| 45002.927083333336 | 9.404 |
| 45002.9375 | 9.432 |
| 45002.947916666664 | 9.488 |
| 45002.958333333336 | 9.562 |
| 45002.96875 | 9.646 |
| 45002.979166666664 | 9.743 |
| 45002.989583333336 | 10.136 |
| 45003.0 | 10.093 |
| 45003.010416666664 | 10.065 |
| 45003.020833333336 | 10.052 |
| 45003.03125 | 10.105 |
| 45003.041666666664 | 10.415 |
| 45003.052083333336 | 10.557 |
| 45003.0625 | 10.712 |
| 45003.072916666664 | 10.632 |
| 45003.083333333336 | 10.613 |
| 45003.09375 | 10.651 |
| 45003.104166666664 | 10.684 |
| 45003.114583333336 | 10.693 |
| 45003.125 | 10.694 |
| 45003.135416666664 | 10.694 |
| 45003.145833333336 | 10.705 |
| 45003.15625 | 10.728 |
| 45003.166666666664 | 10.731 |
| 45003.177083333336 | 10.717 |
| 45003.1875 | 10.704 |
| 45003.197916666664 | 10.69 |
| 45003.208333333336 | 10.675 |
| 45003.21875 | 10.664 |
| 45003.229166666664 | 10.631 |
| 45003.239583333336 | 10.554 |
| 45003.25 | 10.388 |
| 45003.260416666664 | 10.267 |
| 45003.270833333336 | 10.216 |
| 45003.28125 | 10.164 |
| 45003.291666666664 | 10.115 |
| 45003.302083333336 | 10.058 |
| 45003.3125 | 10.03 |
| 45003.322916666664 | 9.991 |
| 45003.333333333336 | 9.929 |
| 45003.34375 | 9.837 |
| 45003.354166666664 | 9.691 |
| 45003.364583333336 | 9.542 |
| 45003.375 | 9.434 |
| 45003.385416666664 | 9.421 |
| 45003.395833333336 | 9.333 |
| 45003.40625 | 9.288 |
| 45003.416666666664 | 9.299 |
| 45003.427083333336 | 9.316 |
| 45003.4375 | 9.317 |
| 45003.447916666664 | 9.322 |
| 45003.458333333336 | 9.333 |
| 45003.46875 | 9.402 |
| 45003.479166666664 | 9.337 |
| 45003.489583333336 | 9.272 |
| 45003.5 | 9.269 |
| 45003.510416666664 | 9.288 |
| 45003.520833333336 | 9.272 |
| 45003.53125 | 9.295 |
| 45003.541666666664 | 9.384 |
| 45003.552083333336 | 9.372 |
| 45003.5625 | 9.465 |
| 45003.572916666664 | 9.574 |
| 45003.583333333336 | 9.637 |
| 45003.59375 | 9.675 |
| 45003.604166666664 | 9.696 |
| 45003.614583333336 | 9.753 |
| 45003.625 | 9.83 |
| 45003.635416666664 | 9.935 |
| 45003.645833333336 | 10.042 |
| 45003.65625 | 10.116 |
| 45003.666666666664 | 10.159 |
| 45003.677083333336 | 10.235 |
| 45003.6875 | 10.289 |
| 45003.697916666664 | 10.338 |
| 45003.708333333336 | 10.449 |
| 45003.71875 | 10.429 |
| 45003.729166666664 | 10.501 |
| 45003.739583333336 | 10.496 |
| 45003.75 | 10.516 |
| 45003.760416666664 | 10.448 |
| 45003.770833333336 | 10.356 |
| 45003.78125 | 10.349 |
| 45003.791666666664 | 10.465 |
| 45003.802083333336 | 10.556 |
| 45003.8125 | 10.61 |
| 45003.822916666664 | 10.659 |
| 45003.833333333336 | 10.697 |
| 45003.84375 | 10.721 |
| 45003.854166666664 | 10.706 |
| 45003.864583333336 | 10.651 |
| 45003.875 | 10.587 |
| 45003.885416666664 | 10.475 |
| 45003.895833333336 | 10.372 |
| 45003.90625 | 10.267 |
| 45003.916666666664 | 10.198 |
| 45003.927083333336 | 10.151 |
| 45003.9375 | 10.125 |
| 45003.947916666664 | 10.108 |
| 45003.958333333336 | 10.076 |
| 45003.96875 | 10.056 |
| 45003.979166666664 | 10.107 |
| 45003.989583333336 | 10.267 |
| 45004.0 | 10.114 |
| 45004.010416666664 | 10.242 |
| 45004.020833333336 | 10.239 |
| 45004.03125 | 10.33 |
| 45004.041666666664 | 10.383 |
| 45004.052083333336 | 10.389 |
| 45004.0625 | 10.472 |
| 45004.072916666664 | 10.565 |
| 45004.083333333336 | 10.689 |
| 45004.09375 | 10.746 |
| 45004.104166666664 | 10.708 |
| 45004.114583333336 | 10.683 |
| 45004.125 | 10.688 |
| 45004.135416666664 | 10.68 |
| 45004.145833333336 | 10.751 |
| 45004.15625 | 10.756 |
| 45004.166666666664 | 10.774 |
| 45004.177083333336 | 10.789 |
| 45004.1875 | 10.78 |
| 45004.197916666664 | 10.774 |
| 45004.208333333336 | 10.765 |
| 45004.21875 | 10.755 |
| 45004.229166666664 | 10.678 |
| 45004.239583333336 | 10.589 |
| 45004.25 | 10.668 |
| 45004.260416666664 | 10.644 |
| 45004.270833333336 | 10.593 |
| 45004.28125 | 10.443 |
| 45004.291666666664 | 10.184 |
| 45004.302083333336 | 9.987 |
| 45004.3125 | 9.931 |
| 45004.322916666664 | 9.84 |
| 45004.333333333336 | 9.719 |
| 45004.34375 | 9.584 |
| 45004.354166666664 | 9.512 |
| 45004.364583333336 | 9.431 |
| 45004.375 | 9.341 |
| 45004.385416666664 | 9.203 |
| 45004.395833333336 | 9.074 |
| 45004.40625 | 8.947 |
| 45004.416666666664 | 8.877 |
| 45004.427083333336 | 8.78 |
| 45004.4375 | 8.768 |
| 45004.447916666664 | 8.763 |
| 45004.458333333336 | 8.803 |
| 45004.46875 | 8.822 |
| 45004.479166666664 | 8.827 |
| 45004.489583333336 | 8.799 |
| 45004.5 | 8.858 |
| 45004.510416666664 | 8.815 |
| 45004.520833333336 | 8.793 |
| 45004.53125 | 8.677 |
| 45004.541666666664 | 8.483 |
| 45004.552083333336 | 8.424 |
| 45004.5625 | 8.4 |
| 45004.572916666664 | 8.406 |
| 45004.583333333336 | 8.453 |
| 45004.59375 | 8.482 |
| 45004.604166666664 | 8.699 |
| 45004.614583333336 | 8.553 |
| 45004.625 | 8.735 |
| 45004.635416666664 | 8.926 |
| 45004.645833333336 | 8.901 |
| 45004.65625 | 9.094 |
| 45004.666666666664 | 9.303 |
| 45004.677083333336 | 9.503 |
| 45004.6875 | 9.739 |
| 45004.697916666664 | 9.658 |
| 45004.708333333336 | 9.797 |
| 45004.71875 | 9.747 |
| 45004.729166666664 | 9.807 |
| 45004.739583333336 | 9.759 |
| 45004.75 | 9.74 |
| 45004.760416666664 | 9.943 |
| 45004.770833333336 | 9.887 |
| 45004.78125 | 9.886 |
| 45004.791666666664 | 9.872 |
| 45004.802083333336 | 9.865 |
| 45004.8125 | 9.812 |
| 45004.822916666664 | 9.812 |
| 45004.833333333336 | 9.884 |
| 45004.84375 | 9.994 |
| 45004.854166666664 | 10.03 |
| 45004.864583333336 | 10.067 |
| 45004.875 | 10.055 |
| 45004.885416666664 | 10.058 |
| 45004.895833333336 | 10.042 |
| 45004.90625 | 9.998 |
| 45004.916666666664 | 9.888 |
| 45004.927083333336 | 9.796 |
| 45004.9375 | 9.645 |
| 45004.947916666664 | 9.467 |
| 45004.958333333336 | 9.391 |
| 45004.96875 | 9.317 |
| 45004.979166666664 | 9.268 |
| 45004.989583333336 | 9.206 |
| 45005.0 | 9.219 |
| 45005.010416666664 | 9.329 |
| 45005.020833333336 | 9.279 |
| 45005.03125 | 9.149 |
| 45005.041666666664 | 9.119 |
| 45005.052083333336 | 9.001 |
| 45005.0625 | 8.961 |
| 45005.072916666664 | 8.966 |
| 45005.083333333336 | 8.863 |
| 45005.09375 | 8.82 |
| 45005.104166666664 | 8.688 |
| 45005.114583333336 | 8.694 |
| 45005.125 | 8.677 |
| 45005.135416666664 | 8.734 |
| 45005.145833333336 | 8.651 |
| 45005.15625 | 8.69 |
| 45005.166666666664 | 8.623 |
| 45005.177083333336 | 8.622 |
| 45005.1875 | 8.591 |
| 45005.197916666664 | 8.535 |
| 45005.208333333336 | 8.521 |
| 45005.21875 | 8.462 |
| 45005.229166666664 | 8.455 |
| 45005.239583333336 | 8.422 |
| 45005.25 | 8.401 |
| 45005.260416666664 | 8.401 |
| 45005.270833333336 | 8.357 |
| 45005.28125 | 8.405 |
| 45005.291666666664 | 8.41 |
| 45005.302083333336 | 8.416 |
| 45005.3125 | 8.369 |
| 45005.322916666664 | 8.311 |
| 45005.333333333336 | 8.244 |
| 45005.34375 | 8.113 |
| 45005.354166666664 | 7.954 |
| 45005.364583333336 | 7.856 |
| 45005.375 | 7.737 |
| 45005.385416666664 | 7.612 |
| 45005.395833333336 | 7.567 |
| 45005.40625 | 7.487 |
| 45005.416666666664 | 7.462 |
| 45005.427083333336 | 7.487 |
| 45005.4375 | 7.455 |
| 45005.447916666664 | 7.442 |
| 45005.458333333336 | 7.438 |
| 45005.46875 | 7.427 |
| 45005.479166666664 | 7.423 |
| 45005.489583333336 | 7.432 |
| 45005.5 | 7.448 |
| 45005.510416666664 | 7.455 |
| 45005.520833333336 | 7.464 |
| 45005.53125 | 7.482 |
| 45005.541666666664 | 7.464 |
| 45005.552083333336 | 7.486 |
| 45005.5625 | 7.43 |
| 45005.572916666664 | 7.356 |
| 45005.583333333336 | 7.294 |
| 45005.59375 | 7.343 |
| 45005.604166666664 | 7.277 |
| 45005.614583333336 | 7.332 |
| 45005.625 | 7.464 |
| 45005.635416666664 | 7.771 |
| 45005.645833333336 | 7.956 |
| 45005.65625 | 8.176 |
| 45005.666666666664 | 8.269 |
| 45005.677083333336 | 8.434 |
| 45005.6875 | 8.518 |
| 45005.697916666664 | 8.674 |
| 45005.708333333336 | 8.779 |
| 45005.71875 | 8.981 |
| 45005.729166666664 | 9.129 |
| 45005.739583333336 | 9.42 |
| 45005.75 | 9.71 |
| 45005.760416666664 | 9.77 |
| 45005.770833333336 | 10.037 |
| 45005.78125 | 9.91 |
| 45005.791666666664 | 9.963 |
| 45005.802083333336 | 9.811 |
| 45005.8125 | 9.688 |
| 45005.822916666664 | 9.611 |
| 45005.833333333336 | 9.663 |
| 45005.84375 | 9.714 |
| 45005.854166666664 | 9.77 |
| 45005.864583333336 | 9.876 |
| 45005.875 | 10.242 |
| 45005.885416666664 | 10.288 |
| 45005.895833333336 | 10.485 |
| 45005.90625 | 10.489 |
| 45005.916666666664 | 10.528 |
| 45005.927083333336 | 10.527 |
| 45005.9375 | 10.328 |
| 45005.947916666664 | 9.993 |
| 45005.958333333336 | 9.743 |
| 45005.96875 | 9.528 |
| 45005.979166666664 | 9.42 |
| 45005.989583333336 | 9.345 |
| 45006.0 | 9.325 |
| 45006.010416666664 | 9.304 |
| 45006.020833333336 | 9.28 |
| 45006.03125 | 9.246 |
| 45006.041666666664 | 9.265 |
| 45006.052083333336 | 9.348 |
| 45006.0625 | 9.193 |
| 45006.072916666664 | 9.185 |
| 45006.083333333336 | 9.19 |
| 45006.09375 | 9.143 |
| 45006.104166666664 | 9.128 |
| 45006.114583333336 | 9.166 |
| 45006.125 | 9.128 |
| 45006.135416666664 | 9.082 |
| 45006.145833333336 | 9.056 |
| 45006.15625 | 9.055 |
| 45006.166666666664 | 9.233 |
| 45006.177083333336 | 9.146 |
| 45006.1875 | 9.142 |
| 45006.197916666664 | 9.114 |
| 45006.208333333336 | 9.057 |
| 45006.21875 | 8.95 |
| 45006.229166666664 | 9.081 |
| 45006.239583333336 | 8.974 |
| 45006.25 | 8.927 |
| 45006.260416666664 | 9.04 |
| 45006.270833333336 | 8.886 |
| 45006.28125 | 8.948 |
| 45006.291666666664 | 8.892 |
| 45006.302083333336 | 8.878 |
| 45006.3125 | 8.827 |
| 45006.322916666664 | 8.796 |
| 45006.333333333336 | 8.917 |
| 45006.34375 | 8.905 |
| 45006.354166666664 | 8.856 |
| 45006.364583333336 | 8.748 |
| 45006.375 | 8.667 |
| 45006.385416666664 | 8.432 |
| 45006.395833333336 | 8.1 |
| 45006.40625 | 7.931 |
| 45006.416666666664 | 7.783 |
| 45006.427083333336 | 7.702 |
| 45006.4375 | 7.623 |
| 45006.447916666664 | 7.558 |
| 45006.458333333336 | 7.594 |
| 45006.46875 | 7.644 |
| 45006.479166666664 | 7.638 |
| 45006.489583333336 | 7.601 |
| 45006.5 | 7.59 |
| 45006.510416666664 | 7.609 |
| 45006.520833333336 | 7.662 |
| 45006.53125 | 7.713 |
| 45006.541666666664 | 7.783 |
| 45006.552083333336 | 7.833 |
| 45006.5625 | 7.892 |
| 45006.572916666664 | 7.866 |
| 45006.583333333336 | 7.988 |
| 45006.59375 | 8.035 |
| 45006.604166666664 | 8.064 |
| 45006.614583333336 | 8.151 |
| 45006.625 | 8.251 |
| 45006.635416666664 | 8.394 |
| 45006.645833333336 | 8.573 |
| 45006.65625 | 8.735 |
| 45006.666666666664 | 8.908 |
| 45006.677083333336 | 9.047 |
| 45006.6875 | 9.365 |
| 45006.697916666664 | 9.801 |
| 45006.708333333336 | 9.939 |
| 45006.71875 | 10.085 |
| 45006.729166666664 | 10.187 |
| 45006.739583333336 | 10.371 |
| 45006.75 | 10.549 |
| 45006.760416666664 | 10.647 |
| 45006.770833333336 | 10.753 |
| 45006.78125 | 10.865 |
| 45006.791666666664 | 11.098 |
| 45006.802083333336 | 11.296 |
| 45006.8125 | 11.254 |
| 45006.822916666664 | 11.525 |
| 45006.833333333336 | 11.342 |
| 45006.84375 | 11.16 |
| 45006.854166666664 | 11.021 |
| 45006.864583333336 | 11.031 |
| 45006.875 | 11.071 |
| 45006.885416666664 | 11.165 |
| 45006.895833333336 | 11.347 |
| 45006.90625 | 11.524 |
| 45006.916666666664 | 11.665 |
| 45006.927083333336 | 11.676 |
| 45006.9375 | 11.653 |
| 45006.947916666664 | 11.548 |
| 45006.958333333336 | 11.322 |
| 45006.96875 | 10.938 |
| 45006.979166666664 | 10.656 |
| 45006.989583333336 | 10.407 |
| 45007.0 | 10.101 |
| 45007.010416666664 | 10.18 |
| 45007.020833333336 | 10.135 |
| 45007.03125 | 10.141 |
| 45007.041666666664 | 10.091 |
| 45007.052083333336 | 10.064 |
| 45007.0625 | 10.028 |
| 45007.072916666664 | 10.031 |
| 45007.083333333336 | 10.15 |
| 45007.09375 | 10.089 |
| 45007.104166666664 | 10.042 |
| 45007.114583333336 | 9.731 |
| 45007.125 | 9.736 |
| 45007.135416666664 | 9.942 |
| 45007.145833333336 | 9.773 |
| 45007.15625 | 9.811 |
| 45007.166666666664 | 9.85 |
| 45007.177083333336 | 9.745 |
| 45007.1875 | 9.818 |
| 45007.197916666664 | 9.931 |
| 45007.208333333336 | 10.06 |
| 45007.21875 | 10.091 |
| 45007.229166666664 | 10.088 |
| 45007.239583333336 | 10.06 |
| 45007.25 | 9.999 |
| 45007.260416666664 | 9.994 |
| 45007.270833333336 | 9.97 |
| 45007.28125 | 9.969 |
| 45007.291666666664 | 9.947 |
| 45007.302083333336 | 9.964 |
| 45007.3125 | 9.894 |
| 45007.322916666664 | 9.875 |
| 45007.333333333336 | 9.904 |
| 45007.34375 | 9.86 |
| 45007.354166666664 | 9.884 |
| 45007.364583333336 | 9.933 |
| 45007.375 | 9.943 |
| 45007.385416666664 | 9.946 |
| 45007.395833333336 | 9.906 |
| 45007.40625 | 9.886 |
| 45007.416666666664 | 9.822 |
| 45007.427083333336 | 9.708 |
| 45007.4375 | 9.609 |
| 45007.447916666664 | 9.541 |
| 45007.458333333336 | 9.475 |
| 45007.46875 | 9.386 |
| 45007.479166666664 | 9.289 |
| 45007.489583333336 | 9.244 |
| 45007.5 | 9.225 |
| 45007.510416666664 | 9.172 |
| 45007.520833333336 | 9.053 |
| 45007.53125 | 8.987 |
| 45007.541666666664 | 8.994 |
| 45007.552083333336 | 9.023 |
| 45007.5625 | 9.075 |
| 45007.572916666664 | 9.134 |
| 45007.583333333336 | 9.188 |
| 45007.59375 | 9.237 |
| 45007.604166666664 | 9.275 |
| 45007.614583333336 | 9.333 |
| 45007.625 | 9.442 |
| 45007.635416666664 | 9.476 |
| 45007.645833333336 | 9.776 |
| 45007.65625 | 9.798 |
| 45007.666666666664 | 10.083 |
| 45007.677083333336 | 10.294 |
| 45007.6875 | 10.555 |
| 45007.697916666664 | 10.641 |
| 45007.708333333336 | 10.857 |
| 45007.71875 | 11.114 |
| 45007.729166666664 | 11.501 |
| 45007.739583333336 | 11.677 |
| 45007.75 | 11.827 |
| 45007.760416666664 | 11.953 |
| 45007.770833333336 | 12.224 |
| 45007.78125 | 12.228 |
| 45007.791666666664 | 12.546 |
| 45007.802083333336 | 12.589 |
| 45007.8125 | 12.713 |
| 45007.822916666664 | 12.801 |
| 45007.833333333336 | 12.819 |
| 45007.84375 | 12.805 |
| 45007.854166666664 | 12.841 |
| 45007.864583333336 | 12.682 |
| 45007.875 | 12.568 |
| 45007.885416666664 | 12.48 |
| 45007.895833333336 | 12.453 |
| 45007.90625 | 12.356 |
| 45007.916666666664 | 12.355 |
| 45007.927083333336 | 12.384 |
| 45007.9375 | 12.425 |
| 45007.947916666664 | 12.444 |
| 45007.958333333336 | 12.413 |
| 45007.96875 | 12.387 |
| 45007.979166666664 | 12.292 |
| 45007.989583333336 | 12.019 |
| 45008.0 | 11.675 |
| 45008.010416666664 | 11.403 |
| 45008.020833333336 | 11.181 |
| 45008.03125 | 11.043 |
| 45008.041666666664 | 11.055 |
| 45008.052083333336 | 11.146 |
| 45008.0625 | 11.185 |
| 45008.072916666664 | 11.174 |
| 45008.083333333336 | 11.128 |
| 45008.09375 | 11.054 |
| 45008.104166666664 | 10.969 |
| 45008.114583333336 | 10.902 |
| 45008.125 | 11.159 |
| 45008.135416666664 | 11.028 |
| 45008.145833333336 | 11.054 |
| 45008.15625 | 11.059 |
| 45008.166666666664 | 11.185 |
| 45008.177083333336 | 11.115 |
| 45008.1875 | 11.165 |
| 45008.197916666664 | 11.198 |
| 45008.208333333336 | 11.233 |
| 45008.21875 | 11.324 |
| 45008.229166666664 | 11.3 |
| 45008.239583333336 | 11.36 |
| 45008.25 | 11.401 |
| 45008.260416666664 | 11.4 |
| 45008.270833333336 | 11.526 |
| 45008.28125 | 11.534 |
| 45008.291666666664 | 11.63 |
| 45008.302083333336 | 11.529 |
| 45008.3125 | 11.685 |
| 45008.322916666664 | 11.788 |
| 45008.333333333336 | 11.71 |
| 45008.34375 | 11.768 |
| 45008.354166666664 | 11.757 |
| 45008.364583333336 | 11.733 |
| 45008.375 | 11.697 |
| 45008.385416666664 | 11.68 |
| 45008.395833333336 | 11.715 |
| 45008.40625 | 11.689 |
| 45008.416666666664 | 11.579 |
| 45008.427083333336 | 11.377 |
| 45008.4375 | 11.313 |
| 45008.447916666664 | 11.22 |
| 45008.458333333336 | 11.106 |
| 45008.46875 | 10.989 |
| 45008.479166666664 | 10.89 |
| 45008.489583333336 | 10.853 |
| 45008.5 | 10.817 |
| 45008.510416666664 | 10.733 |
| 45008.520833333336 | 10.661 |
| 45008.53125 | 10.568 |
| 45008.541666666664 | 10.501 |
| 45008.552083333336 | 10.463 |
| 45008.5625 | 10.523 |
| 45008.572916666664 | 10.674 |
| 45008.583333333336 | 10.826 |
| 45008.59375 | 10.917 |
| 45008.604166666664 | 10.964 |
| 45008.614583333336 | 10.992 |
| 45008.625 | 11.04 |
| 45008.635416666664 | 11.204 |
| 45008.645833333336 | 11.239 |
| 45008.65625 | 11.45 |
| 45008.666666666664 | 11.58 |
| 45008.677083333336 | 11.749 |
| 45008.6875 | 12.409 |
| 45008.697916666664 | 12.933 |
| 45008.708333333336 | 13.041 |
| 45008.71875 | 13.644 |
| 45008.729166666664 | 13.995 |
| 45008.739583333336 | 14.076 |
| 45008.75 | 13.824 |
| 45008.760416666664 | 14.276 |
| 45008.770833333336 | 14.598 |
| 45008.78125 | 14.988 |
| 45008.791666666664 | 15.16 |
| 45008.802083333336 | 15.059 |
| 45008.8125 | 15.233 |
| 45008.822916666664 | 15.357 |
| 45008.833333333336 | 15.414 |
| 45008.84375 | 15.516 |
| 45008.854166666664 | 15.544 |
| 45008.864583333336 | 15.592 |
| 45008.875 | 15.607 |
| 45008.885416666664 | 15.653 |
| 45008.895833333336 | 15.487 |
| 45008.90625 | 15.298 |
| 45008.916666666664 | 15.164 |
| 45008.927083333336 | 15.125 |
| 45008.9375 | 15.051 |
| 45008.947916666664 | 15.016 |
| 45008.958333333336 | 15.01 |
| 45008.96875 | 15.019 |
| 45008.979166666664 | 15.035 |
| 45008.989583333336 | 15.035 |
| 45009.0 | 14.958 |
| 45009.010416666664 | 14.776 |
| 45009.020833333336 | 14.522 |
| 45009.03125 | 14.277 |
| 45009.041666666664 | 13.917 |
| 45009.052083333336 | 13.681 |
| 45009.0625 | 13.508 |
| 45009.072916666664 | 13.406 |
| 45009.083333333336 | 13.411 |
| 45009.09375 | 13.483 |
| 45009.104166666664 | 13.503 |
| 45009.114583333336 | 13.457 |
| 45009.125 | 13.389 |
| 45009.135416666664 | 13.301 |
| 45009.145833333336 | 13.278 |
| 45009.15625 | 13.47 |
| 45009.166666666664 | 13.297 |
| 45009.177083333336 | 13.309 |
| 45009.1875 | 13.583 |
| 45009.197916666664 | 13.732 |
| 45009.208333333336 | 13.83 |
| 45009.21875 | 13.909 |
| 45009.229166666664 | 14.003 |
| 45009.239583333336 | 14.215 |
| 45009.25 | 14.396 |
| 45009.260416666664 | 14.462 |
| 45009.270833333336 | 14.563 |
| 45009.28125 | 14.642 |
| 45009.291666666664 | 14.684 |
| 45009.302083333336 | 14.831 |
| 45009.3125 | 14.906 |
| 45009.322916666664 | 14.969 |
| 45009.333333333336 | 15.005 |
| 45009.34375 | 15.113 |
| 45009.354166666664 | 15.202 |
| 45009.364583333336 | 15.228 |
| 45009.375 | 15.232 |
| 45009.385416666664 | 15.269 |
| 45009.395833333336 | 15.283 |
| 45009.40625 | 15.225 |
| 45009.416666666664 | 15.18 |
| 45009.427083333336 | 15.179 |
| 45009.4375 | 15.151 |
| 45009.447916666664 | 15.058 |
| 45009.458333333336 | 14.766 |
| 45009.46875 | 14.684 |
| 45009.479166666664 | 14.582 |
| 45009.489583333336 | 14.472 |
| 45009.5 | 14.372 |
| 45009.510416666664 | 14.288 |
| 45009.520833333336 | 14.244 |
| 45009.53125 | 14.189 |
| 45009.541666666664 | 14.168 |
| 45009.552083333336 | 14.067 |
| 45009.5625 | 13.874 |
| 45009.572916666664 | 13.678 |
| 45009.583333333336 | 13.487 |
| 45009.59375 | 13.408 |
| 45009.604166666664 | 13.392 |
| 45009.614583333336 | 13.428 |
| 45009.625 | 13.546 |
| 45009.635416666664 | 13.657 |
| 45009.645833333336 | 13.901 |
| 45009.65625 | 13.85 |
| 45009.666666666664 | 13.931 |
| 45009.677083333336 | 14.05 |
| 45009.6875 | 14.221 |
| 45009.697916666664 | 14.328 |
| 45009.708333333336 | 14.614 |
| 45009.71875 | 14.86 |
| 45009.729166666664 | 14.919 |
| 45009.739583333336 | 15.617 |
| 45009.75 | 15.551 |
| 45009.760416666664 | 16.266 |
| 45009.770833333336 | 16.487 |
| 45009.78125 | 16.653 |
| 45009.791666666664 | 16.632 |
| 45009.802083333336 | 16.418 |
| 45009.8125 | 16.691 |
| 45009.822916666664 | 17.01 |
| 45009.833333333336 | 17.122 |
| 45009.84375 | 17.232 |
| 45009.854166666664 | 17.275 |
| 45009.864583333336 | 17.209 |
| 45009.875 | 17.134 |
| 45009.885416666664 | 17.108 |
| 45009.895833333336 | 17.061 |
| 45009.90625 | 16.993 |
| 45009.916666666664 | 16.914 |
| 45009.927083333336 | 16.917 |
| 45009.9375 | 16.85 |
| 45009.947916666664 | 16.741 |
| 45009.958333333336 | 16.574 |
| 45009.96875 | 16.391 |
| 45009.979166666664 | 16.074 |
| 45009.989583333336 | 15.803 |
| 45010.0 | 15.471 |
| 45010.010416666664 | 15.279 |
| 45010.020833333336 | 15.114 |
| 45010.03125 | 14.789 |
| 45010.041666666664 | 14.439 |
| 45010.052083333336 | 14.28 |
| 45010.0625 | 14.098 |
| 45010.072916666664 | 14.001 |
| 45010.083333333336 | 13.886 |
| 45010.09375 | 13.716 |
| 45010.104166666664 | 13.593 |
| 45010.114583333336 | 13.471 |
| 45010.125 | 13.374 |
| 45010.135416666664 | 13.333 |
| 45010.145833333336 | 13.319 |
| 45010.15625 | 13.508 |
| 45010.166666666664 | 13.44 |
| 45010.177083333336 | 13.678 |
| 45010.1875 | 13.704 |
| 45010.197916666664 | 13.509 |
| 45010.208333333336 | 13.428 |
| 45010.21875 | 13.368 |
| 45010.229166666664 | 13.367 |
| 45010.239583333336 | 13.168 |
| 45010.25 | 13.026 |
| 45010.260416666664 | 12.986 |
| 45010.270833333336 | 12.903 |
| 45010.28125 | 12.886 |
| 45010.291666666664 | 12.829 |
| 45010.302083333336 | 12.753 |
| 45010.3125 | 12.714 |
| 45010.322916666664 | 12.676 |
| 45010.333333333336 | 12.608 |
| 45010.34375 | 12.742 |
| 45010.354166666664 | 12.784 |
| 45010.364583333336 | 12.926 |
| 45010.375 | 13.09 |
| 45010.385416666664 | 13.102 |
| 45010.395833333336 | 13.175 |
| 45010.40625 | 13.329 |
| 45010.416666666664 | 13.336 |
| 45010.427083333336 | 13.419 |
| 45010.4375 | 13.455 |
| 45010.447916666664 | 13.429 |
| 45010.458333333336 | 13.298 |
| 45010.46875 | 13.345 |
| 45010.479166666664 | 13.336 |
| 45010.489583333336 | 13.287 |
| 45010.5 | 13.209 |
| 45010.510416666664 | 13.114 |
| 45010.520833333336 | 13.017 |
| 45010.53125 | 12.869 |
| 45010.541666666664 | 12.752 |
| 45010.552083333336 | 12.646 |
| 45010.5625 | 12.531 |
| 45010.572916666664 | 12.46 |
| 45010.583333333336 | 12.384 |
| 45010.59375 | 12.397 |
| 45010.604166666664 | 12.413 |
| 45010.614583333336 | 12.42 |
| 45010.625 | 12.455 |
| 45010.635416666664 | 12.525 |
| 45010.645833333336 | 12.585 |
| 45010.65625 | 12.613 |
| 45010.666666666664 | 12.628 |
| 45010.677083333336 | 12.643 |
| 45010.6875 | 12.657 |
| 45010.697916666664 | 12.729 |
| 45010.708333333336 | 12.779 |
| 45010.71875 | 12.8 |
| 45010.729166666664 | 12.955 |
| 45010.739583333336 | 13.185 |
| 45010.75 | 13.335 |
| 45010.760416666664 | 13.33 |
| 45010.770833333336 | 13.331 |
| 45010.78125 | 13.318 |
| 45010.791666666664 | 13.33 |
| 45010.802083333336 | 13.556 |
| 45010.8125 | 13.492 |
| 45010.822916666664 | 13.622 |
| 45010.833333333336 | 13.719 |
| 45010.84375 | 13.857 |
| 45010.854166666664 | 14.03 |
| 45010.864583333336 | 14.047 |
| 45010.875 | 14.116 |
| 45010.885416666664 | 14.187 |
| 45010.895833333336 | 14.177 |
| 45010.90625 | 14.299 |
| 45010.916666666664 | 14.281 |
| 45010.927083333336 | 14.206 |
| 45010.9375 | 14.223 |
| 45010.947916666664 | 14.109 |
| 45010.958333333336 | 14.037 |
| 45010.96875 | 13.978 |
| 45010.979166666664 | 13.942 |
| 45010.989583333336 | 13.87 |
| 45011.0 | 13.766 |
| 45011.010416666664 | 13.684 |
| 45011.020833333336 | 13.641 |
| 45011.03125 | 13.612 |
| 45011.041666666664 | 13.571 |
| 45011.052083333336 | 13.54 |
| 45011.0625 | 13.503 |
| 45011.072916666664 | 13.465 |
| 45011.083333333336 | 13.428 |
| 45011.09375 | 13.389 |
| 45011.104166666664 | 13.36 |
| 45011.114583333336 | 13.313 |
| 45011.125 | 13.263 |
| 45011.135416666664 | 13.198 |
| 45011.145833333336 | 13.135 |
| 45011.15625 | 13.117 |
| 45011.166666666664 | 13.133 |
| 45011.177083333336 | 13.159 |
| 45011.1875 | 13.179 |
| 45011.197916666664 | 13.174 |
| 45011.208333333336 | 13.165 |
| 45011.21875 | 13.233 |
| 45011.229166666664 | 13.218 |
| 45011.239583333336 | 13.213 |
| 45011.25 | 13.232 |
| 45011.260416666664 | 13.268 |
| 45011.270833333336 | 13.265 |
| 45011.28125 | 13.299 |
| 45011.291666666664 | 13.33 |
| 45011.302083333336 | 13.323 |
| 45011.3125 | 13.377 |
| 45011.322916666664 | 13.378 |
| 45011.333333333336 | 13.37 |
| 45011.34375 | 13.372 |
| 45011.354166666664 | 13.343 |
| 45011.364583333336 | 13.355 |
| 45011.375 | 13.365 |
| 45011.385416666664 | 13.366 |
| 45011.395833333336 | 13.405 |
| 45011.40625 | 13.401 |
| 45011.416666666664 | 13.519 |
| 45011.427083333336 | 13.573 |
| 45011.4375 | 13.645 |
| 45011.447916666664 | 13.653 |
| 45011.458333333336 | 13.67 |
| 45011.46875 | 13.664 |
| 45011.479166666664 | 13.649 |
| 45011.489583333336 | 13.603 |
| 45011.5 | 13.584 |
| 45011.510416666664 | 13.585 |
| 45011.520833333336 | 13.567 |
| 45011.53125 | 13.508 |
| 45011.541666666664 | 13.454 |
| 45011.552083333336 | 13.383 |
| 45011.5625 | 13.258 |
| 45011.572916666664 | 13.19 |
| 45011.583333333336 | 13.176 |
| 45011.59375 | 13.201 |
| 45011.604166666664 | 13.248 |
| 45011.614583333336 | 13.27 |
| 45011.625 | 13.323 |
| 45011.635416666664 | 13.357 |
| 45011.645833333336 | 13.412 |
| 45011.65625 | 13.459 |
| 45011.666666666664 | 13.494 |
| 45011.677083333336 | 13.531 |
| 45011.6875 | 13.557 |
| 45011.697916666664 | 13.616 |
| 45011.708333333336 | 13.576 |
| 45011.71875 | 13.578 |
| 45011.729166666664 | 13.631 |
| 45011.739583333336 | 13.721 |
| 45011.75 | 13.91 |
| 45011.760416666664 | 14.274 |
| 45011.770833333336 | 14.534 |
| 45011.78125 | 14.798 |
| 45011.791666666664 | 14.986 |
| 45011.802083333336 | 15.48 |
| 45011.8125 | 14.847 |
| 45011.822916666664 | 15.197 |
| 45011.833333333336 | 16.052 |
| 45011.84375 | 15.645 |
| 45011.854166666664 | 15.604 |
| 45011.864583333336 | 15.854 |
| 45011.875 | 16.02 |
| 45011.885416666664 | 16.252 |
| 45011.895833333336 | 16.23 |
| 45011.90625 | 16.393 |
| 45011.916666666664 | 16.149 |
| 45011.927083333336 | 16.157 |
| 45011.9375 | 15.962 |
| 45011.947916666664 | 15.908 |
| 45011.958333333336 | 15.903 |
| 45011.96875 | 15.887 |
| 45011.979166666664 | 15.864 |
| 45011.989583333336 | 15.837 |
| 45012.0 | 15.799 |
| 45012.010416666664 | 15.764 |
| 45012.020833333336 | 15.694 |
| 45012.03125 | 15.563 |
| 45012.041666666664 | 15.356 |
| 45012.052083333336 | 15.026 |
| 45012.0625 | 14.861 |
| 45012.072916666664 | 14.775 |
| 45012.083333333336 | 14.677 |
| 45012.09375 | 14.624 |
| 45012.104166666664 | 14.565 |
| 45012.114583333336 | 14.466 |
| 45012.125 | 14.38 |
| 45012.135416666664 | 14.319 |
| 45012.145833333336 | 14.225 |
| 45012.15625 | 14.156 |
| 45012.166666666664 | 14.101 |
| 45012.177083333336 | 13.962 |
| 45012.1875 | 13.906 |
| 45012.197916666664 | 13.89 |
| 45012.208333333336 | 13.845 |
| 45012.21875 | 13.797 |
| 45012.229166666664 | 13.773 |
| 45012.239583333336 | 13.779 |
| 45012.25 | 13.974 |
| 45012.260416666664 | 13.792 |
| 45012.270833333336 | 13.761 |
| 45012.28125 | 13.781 |
| 45012.291666666664 | 13.715 |
| 45012.302083333336 | 13.623 |
| 45012.3125 | 13.529 |
| 45012.322916666664 | 13.468 |
| 45012.333333333336 | 13.413 |
| 45012.34375 | 13.389 |
| 45012.354166666664 | 13.285 |
| 45012.364583333336 | 13.427 |
| 45012.375 | 13.473 |
| 45012.385416666664 | 13.709 |
| 45012.395833333336 | 13.75 |
| 45012.40625 | 13.815 |
| 45012.416666666664 | 13.858 |
| 45012.427083333336 | 13.925 |
| 45012.4375 | 13.947 |
| 45012.447916666664 | 14.003 |
| 45012.458333333336 | 14.079 |
| 45012.46875 | 14.104 |
| 45012.479166666664 | 14.12 |
| 45012.489583333336 | 14.131 |
| 45012.5 | 14.13 |
| 45012.510416666664 | 14.124 |
| 45012.520833333336 | 14.074 |
| 45012.53125 | 14.039 |
| 45012.541666666664 | 14.039 |
| 45012.552083333336 | 14.02 |
| 45012.5625 | 13.972 |
| 45012.572916666664 | 13.927 |
| 45012.583333333336 | 13.83 |
| 45012.59375 | 13.721 |
| 45012.604166666664 | 13.67 |
| 45012.614583333336 | 13.613 |
| 45012.625 | 13.564 |
| 45012.635416666664 | 13.536 |
| 45012.645833333336 | 13.5 |
| 45012.65625 | 13.481 |
| 45012.666666666664 | 13.457 |
| 45012.677083333336 | 13.452 |
| 45012.6875 | 13.474 |
| 45012.697916666664 | 13.453 |
| 45012.708333333336 | 13.468 |
| 45012.71875 | 13.469 |
| 45012.729166666664 | 13.486 |
| 45012.739583333336 | 13.583 |
| 45012.75 | 13.578 |
| 45012.760416666664 | 13.604 |
| 45012.770833333336 | 13.645 |
| 45012.78125 | 13.675 |
| 45012.791666666664 | 13.831 |
| 45012.802083333336 | 13.901 |
| 45012.8125 | 14.165 |
| 45012.822916666664 | 14.157 |
| 45012.833333333336 | 14.274 |
| 45012.84375 | 14.177 |
| 45012.854166666664 | 14.259 |
| 45012.864583333336 | 14.088 |
| 45012.875 | 14.25 |
| 45012.885416666664 | 14.347 |
| 45012.895833333336 | 14.386 |
| 45012.90625 | 14.493 |
| 45012.916666666664 | 14.528 |
| 45012.927083333336 | 14.666 |
| 45012.9375 | 14.538 |
| 45012.947916666664 | 14.548 |
| 45012.958333333336 | 14.613 |
| 45012.96875 | 14.617 |
| 45012.979166666664 | 14.662 |
| 45012.989583333336 | 14.713 |
| 45013.0 | 14.694 |
| 45013.010416666664 | 14.608 |
| 45013.020833333336 | 14.548 |
| 45013.03125 | 14.507 |
| 45013.041666666664 | 14.426 |
| 45013.052083333336 | 14.337 |
| 45013.0625 | 14.259 |
| 45013.072916666664 | 14.185 |
| 45013.083333333336 | 14.114 |
| 45013.09375 | 14.078 |
| 45013.104166666664 | 14.019 |
| 45013.114583333336 | 13.979 |
| 45013.125 | 13.941 |
| 45013.135416666664 | 13.928 |
| 45013.145833333336 | 13.909 |
| 45013.15625 | 13.899 |
| 45013.166666666664 | 13.879 |
| 45013.177083333336 | 14.057 |
| 45013.1875 | 14.053 |
| 45013.197916666664 | 14.062 |
| 45013.208333333336 | 14.058 |
| 45013.21875 | 14.041 |
| 45013.229166666664 | 14.018 |
| 45013.239583333336 | 13.98 |
| 45013.25 | 13.947 |
| 45013.260416666664 | 13.922 |
| 45013.270833333336 | 13.944 |
| 45013.28125 | 13.957 |
| 45013.291666666664 | 13.866 |
| 45013.302083333336 | 13.834 |
| 45013.3125 | 13.763 |
| 45013.322916666664 | 13.692 |
| 45013.333333333336 | 13.592 |
| 45013.34375 | 13.503 |
| 45013.354166666664 | 13.501 |
| 45013.364583333336 | 13.382 |
| 45013.375 | 13.281 |
| 45013.385416666664 | 13.233 |
| 45013.395833333336 | 13.148 |
| 45013.40625 | 13.186 |
| 45013.416666666664 | 13.215 |
| 45013.427083333336 | 13.246 |
| 45013.4375 | 13.255 |
| 45013.447916666664 | 13.316 |
| 45013.458333333336 | 13.243 |
| 45013.46875 | 13.312 |
| 45013.479166666664 | 13.273 |
| 45013.489583333336 | 13.36 |
| 45013.5 | 13.366 |
| 45013.510416666664 | 13.41 |
| 45013.520833333336 | 13.418 |
| 45013.53125 | 13.433 |
| 45013.541666666664 | 13.488 |
| 45013.552083333336 | 13.516 |
| 45013.5625 | 13.48 |
| 45013.572916666664 | 13.493 |
| 45013.583333333336 | 13.496 |
| 45013.59375 | 13.49 |
| 45013.604166666664 | 13.494 |
| 45013.614583333336 | 13.484 |
| 45013.625 | 13.491 |
| 45013.635416666664 | 13.51 |
| 45013.645833333336 | 13.538 |
| 45013.65625 | 13.564 |
| 45013.666666666664 | 13.594 |
| 45013.677083333336 | 13.633 |
| 45013.6875 | 13.678 |
| 45013.697916666664 | 13.736 |
| 45013.708333333336 | 13.79 |
| 45013.71875 | 13.841 |
| 45013.729166666664 | 13.893 |
| 45013.739583333336 | 13.934 |
| 45013.75 | 13.956 |
| 45013.760416666664 | 13.988 |
| 45013.770833333336 | 14.003 |
| 45013.78125 | 14.02 |
| 45013.791666666664 | 14.029 |
| 45013.802083333336 | 14.088 |
| 45013.8125 | 14.125 |
| 45013.822916666664 | 14.22 |
| 45013.833333333336 | 14.293 |
| 45013.84375 | 14.431 |
| 45013.854166666664 | 14.515 |
| 45013.864583333336 | 14.537 |
| 45013.875 | 14.681 |
| 45013.885416666664 | 14.913 |
| 45013.895833333336 | 15.144 |
| 45013.90625 | 15.143 |
| 45013.916666666664 | 15.285 |
| 45013.927083333336 | 15.236 |
| 45013.9375 | 15.074 |
| 45013.947916666664 | 15.161 |
| 45013.958333333336 | 15.186 |
| 45013.96875 | 15.209 |
| 45013.979166666664 | 15.219 |
| 45013.989583333336 | 15.193 |
| 45014.0 | 15.179 |
| 45014.010416666664 | 15.165 |
| 45014.020833333336 | 15.17 |
| 45014.03125 | 15.141 |
| 45014.041666666664 | 15.139 |
| 45014.052083333336 | 15.12 |
| 45014.0625 | 15.093 |
| 45014.072916666664 | 15.012 |
| 45014.083333333336 | 15.001 |
| 45014.09375 | 14.985 |
| 45014.104166666664 | 14.937 |
| 45014.114583333336 | 14.856 |
| 45014.125 | 14.778 |
| 45014.135416666664 | 14.616 |
| 45014.145833333336 | 14.423 |
| 45014.15625 | 14.282 |
| 45014.166666666664 | 14.13 |
| 45014.177083333336 | 14.028 |
| 45014.1875 | 13.954 |
| 45014.197916666664 | 13.86 |
| 45014.208333333336 | 13.819 |
| 45014.21875 | 13.752 |
| 45014.229166666664 | 13.683 |
| 45014.239583333336 | 13.626 |
| 45014.25 | 13.565 |
| 45014.260416666664 | 13.513 |
| 45014.270833333336 | 13.452 |
| 45014.28125 | 13.403 |
| 45014.291666666664 | 13.36 |
| 45014.302083333336 | 13.371 |
| 45014.3125 | 13.534 |
| 45014.322916666664 | 13.43 |
| 45014.333333333336 | 13.383 |
| 45014.34375 | 13.321 |
| 45014.354166666664 | 13.298 |
| 45014.364583333336 | 13.336 |
| 45014.375 | 13.224 |
| 45014.385416666664 | 13.184 |
| 45014.395833333336 | 13.231 |
| 45014.40625 | 13.185 |
| 45014.416666666664 | 13.207 |
| 45014.427083333336 | 13.119 |
| 45014.4375 | 13.04 |
| 45014.447916666664 | 12.83 |
| 45014.458333333336 | 12.773 |
| 45014.46875 | 12.742 |
| 45014.479166666664 | 12.655 |
| 45014.489583333336 | 12.606 |
| 45014.5 | 12.725 |
| 45014.510416666664 | 12.688 |
| 45014.520833333336 | 12.701 |
| 45014.53125 | 12.695 |
| 45014.541666666664 | 12.753 |
| 45014.552083333336 | 12.792 |
| 45014.5625 | 12.829 |
| 45014.572916666664 | 12.849 |
| 45014.583333333336 | 12.92 |
| 45014.59375 | 12.97 |
| 45014.604166666664 | 12.99 |
| 45014.614583333336 | 13.022 |
| 45014.625 | 13.019 |
| 45014.635416666664 | 13.081 |
| 45014.645833333336 | 13.113 |
| 45014.65625 | 13.14 |
| 45014.666666666664 | 13.207 |
| 45014.677083333336 | 13.237 |
| 45014.6875 | 13.319 |
| 45014.697916666664 | 13.4 |
| 45014.708333333336 | 13.53 |
| 45014.71875 | 13.628 |
| 45014.729166666664 | 13.756 |
| 45014.739583333336 | 13.807 |
| 45014.75 | 13.919 |
| 45014.760416666664 | 14.037 |
| 45014.770833333336 | 14.097 |
| 45014.78125 | 14.176 |
| 45014.791666666664 | 14.265 |
| 45014.802083333336 | 14.322 |
| 45014.8125 | 14.372 |
| 45014.822916666664 | 14.427 |
| 45014.833333333336 | 14.521 |
| 45014.84375 | 14.859 |
| 45014.854166666664 | 15.412 |
| 45014.864583333336 | 15.857 |
| 45014.875 | 15.875 |
| 45014.885416666664 | 16.201 |
| 45014.895833333336 | 16.556 |
| 45014.90625 | 17.051 |
| 45014.916666666664 | 17.05 |
| 45014.927083333336 | 16.787 |
| 45014.9375 | 16.671 |
| 45014.947916666664 | 16.501 |
| 45014.958333333336 | 16.101 |
| 45014.96875 | 15.816 |
| 45014.979166666664 | 15.486 |
| 45014.989583333336 | 15.538 |
| 45015.0 | 15.71 |
| 45015.010416666664 | 15.772 |
| 45015.020833333336 | 15.767 |
| 45015.03125 | 15.709 |
| 45015.041666666664 | 15.712 |
| 45015.052083333336 | 15.709 |
| 45015.0625 | 15.667 |
| 45015.072916666664 | 15.58 |
| 45015.083333333336 | 15.496 |
| 45015.09375 | 15.423 |
| 45015.104166666664 | 15.426 |
| 45015.114583333336 | 15.298 |
| 45015.125 | 15.107 |
| 45015.135416666664 | 14.831 |
| 45015.145833333336 | 14.624 |
| 45015.15625 | 14.42 |
| 45015.166666666664 | 14.246 |
| 45015.177083333336 | 14.1 |
| 45015.1875 | 13.966 |
| 45015.197916666664 | 13.87 |
| 45015.208333333336 | 13.826 |
| 45015.21875 | 13.75 |
| 45015.229166666664 | 13.694 |
| 45015.239583333336 | 13.631 |
| 45015.25 | 13.557 |
| 45015.260416666664 | 13.516 |
| 45015.270833333336 | 13.495 |
| 45015.28125 | 13.468 |
| 45015.291666666664 | 13.43 |
| 45015.302083333336 | 13.417 |
| 45015.3125 | 13.378 |
| 45015.322916666664 | 13.352 |
| 45015.333333333336 | 13.363 |
| 45015.34375 | 13.349 |
| 45015.354166666664 | 13.416 |
| 45015.364583333336 | 13.286 |
| 45015.375 | 13.131 |
| 45015.385416666664 | 12.85 |
| 45015.395833333336 | 12.721 |
| 45015.40625 | 12.494 |
| 45015.416666666664 | 12.406 |
| 45015.427083333336 | 12.348 |
| 45015.4375 | 12.352 |
| 45015.447916666664 | 12.236 |
| 45015.458333333336 | 11.996 |
| 45015.46875 | 12.024 |
| 45015.479166666664 | 11.811 |
| 45015.489583333336 | 11.841 |
| 45015.5 | 12.121 |
| 45015.510416666664 | 12.069 |
| 45015.520833333336 | 12.184 |
| 45015.53125 | 12.217 |
| 45015.541666666664 | 12.214 |
| 45015.552083333336 | 12.23 |
| 45015.5625 | 12.232 |
| 45015.572916666664 | 12.251 |
| 45015.583333333336 | 12.29 |
| 45015.59375 | 12.386 |
| 45015.604166666664 | 12.458 |
| 45015.614583333336 | 12.45 |
| 45015.625 | 12.568 |
| 45015.635416666664 | 12.53 |
| 45015.645833333336 | 12.637 |
| 45015.65625 | 12.592 |
| 45015.666666666664 | 12.628 |
| 45015.677083333336 | 12.689 |
| 45015.6875 | 12.687 |
| 45015.697916666664 | 12.717 |
| 45015.708333333336 | 12.745 |
| 45015.71875 | 12.737 |
| 45015.729166666664 | 12.783 |
| 45015.739583333336 | 12.887 |
| 45015.75 | 13.084 |
| 45015.760416666664 | 13.143 |
| 45015.770833333336 | 13.207 |
| 45015.78125 | 13.282 |
| 45015.791666666664 | 13.312 |
| 45015.802083333336 | 13.373 |
| 45015.8125 | 13.365 |
| 45015.822916666664 | 13.426 |
| 45015.833333333336 | 13.441 |
| 45015.84375 | 13.471 |
| 45015.854166666664 | 13.508 |
| 45015.864583333336 | 13.549 |
| 45015.875 | 13.629 |
| 45015.885416666664 | 13.632 |
| 45015.895833333336 | 13.712 |
| 45015.90625 | 13.765 |
| 45015.916666666664 | 13.853 |
| 45015.927083333336 | 13.863 |
| 45015.9375 | 14.251 |
| 45015.947916666664 | 14.456 |
| 45015.958333333336 | 14.345 |
| 45015.96875 | 14.577 |
| 45015.979166666664 | 14.36 |
| 45015.989583333336 | 14.418 |
| 45016.0 | 14.302 |
| 45016.010416666664 | 14.289 |
| 45016.020833333336 | 14.32 |
| 45016.03125 | 14.384 |
| 45016.041666666664 | 14.366 |
| 45016.052083333336 | 14.239 |
| 45016.0625 | 14.244 |
| 45016.072916666664 | 14.289 |
| 45016.083333333336 | 14.329 |
| 45016.09375 | 14.363 |
| 45016.104166666664 | 14.297 |
| 45016.114583333336 | 14.275 |
| 45016.125 | 14.246 |
| 45016.135416666664 | 14.201 |
| 45016.145833333336 | 14.104 |
| 45016.15625 | 14.027 |
| 45016.166666666664 | 13.985 |
| 45016.177083333336 | 13.904 |
| 45016.1875 | 13.803 |
| 45016.197916666664 | 13.631 |
| 45016.208333333336 | 13.399 |
| 45016.21875 | 13.218 |
| 45016.229166666664 | 13.054 |
| 45016.239583333336 | 12.916 |
| 45016.25 | 12.812 |
| 45016.260416666664 | 12.736 |
| 45016.270833333336 | 12.714 |
| 45016.28125 | 12.608 |
| 45016.291666666664 | 12.529 |
| 45016.302083333336 | 12.476 |
| 45016.3125 | 12.423 |
| 45016.322916666664 | 12.372 |
| 45016.333333333336 | 12.363 |
| 45016.34375 | 12.35 |
| 45016.354166666664 | 12.305 |
| 45016.364583333336 | 12.267 |
| 45016.375 | 12.228 |
| 45016.385416666664 | 12.216 |
| 45016.395833333336 | 12.165 |
| 45016.40625 | 12.368 |
| 45016.416666666664 | 12.199 |
| 45016.427083333336 | 12.014 |
| 45016.4375 | 11.921 |
| 45016.447916666664 | 11.99 |
| 45016.458333333336 | 11.736 |
| 45016.46875 | 11.626 |
| 45016.479166666664 | 11.583 |
| 45016.489583333336 | 11.377 |
| 45016.5 | 11.319 |
| 45016.510416666664 | 11.372 |
| 45016.520833333336 | 11.451 |
| 45016.53125 | 11.514 |
| 45016.541666666664 | 11.41 |
| 45016.552083333336 | 11.406 |
| 45016.5625 | 11.479 |
| 45016.572916666664 | 11.564 |
| 45016.583333333336 | 11.659 |
| 45016.59375 | 11.742 |
| 45016.604166666664 | 11.803 |
| 45016.614583333336 | 11.876 |
| 45016.625 | 11.907 |
| 45016.635416666664 | 11.96 |
| 45016.645833333336 | 11.999 |
| 45016.65625 | 12.018 |
| 45016.666666666664 | 12.021 |
| 45016.677083333336 | 12.058 |
| 45016.6875 | 12.331 |
| 45016.697916666664 | 12.261 |
| 45016.708333333336 | 12.147 |
| 45016.71875 | 12.093 |
| 45016.729166666664 | 12.172 |
| 45016.739583333336 | 12.422 |
| 45016.75 | 12.843 |
| 45016.760416666664 | 13.079 |
| 45016.770833333336 | 13.171 |
| 45016.78125 | 13.344 |
| 45016.791666666664 | 13.483 |
| 45016.802083333336 | 13.594 |
| 45016.8125 | 13.664 |
| 45016.822916666664 | 13.729 |
| 45016.833333333336 | 13.781 |
| 45016.84375 | 13.837 |
| 45016.854166666664 | 13.859 |
| 45016.864583333336 | 13.891 |
| 45016.875 | 13.92 |
| 45016.885416666664 | 13.937 |
| 45016.895833333336 | 13.956 |
| 45016.90625 | 13.973 |
| 45016.916666666664 | 13.96 |
| 45016.927083333336 | 13.89 |
| 45016.9375 | 13.895 |
| 45016.947916666664 | 13.922 |
| 45016.958333333336 | 13.966 |
| 45016.96875 | 14.058 |
| 45016.979166666664 | 14.053 |
| 45016.989583333336 | 14.139 |
| 45017.0 | 14.065 |
| 45017.010416666664 | 13.996 |
| 45017.020833333336 | 13.978 |
| 45017.03125 | 13.968 |
| 45017.041666666664 | 13.898 |
| 45017.052083333336 | 13.784 |
| 45017.0625 | 13.75 |
| 45017.072916666664 | 13.726 |
| 45017.083333333336 | 13.718 |
| 45017.09375 | 13.726 |
| 45017.104166666664 | 13.734 |
| 45017.114583333336 | 13.769 |
| 45017.125 | 13.843 |
| 45017.135416666664 | 13.845 |
| 45017.145833333336 | 13.808 |